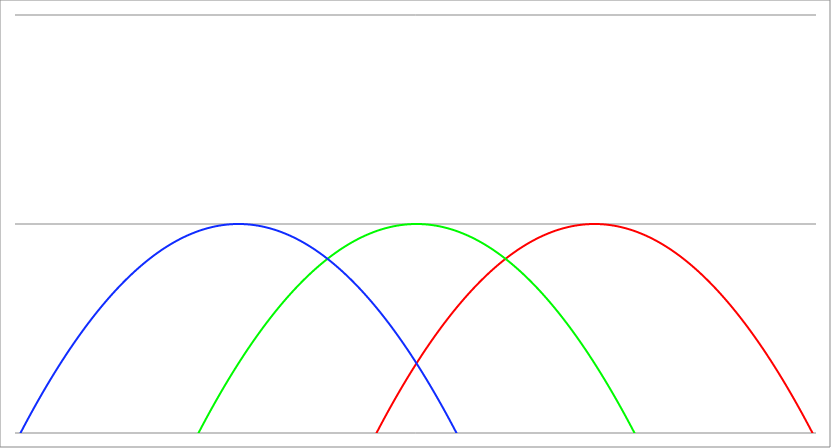
| Category | Series 1 | Series 0 | Series 2 |
|---|---|---|---|
| -4.5 | -42.25 | -20.25 | -6.25 |
| -4.4955 | -42.192 | -20.21 | -6.228 |
| -4.491 | -42.133 | -20.169 | -6.205 |
| -4.4865 | -42.075 | -20.129 | -6.183 |
| -4.482 | -42.016 | -20.088 | -6.16 |
| -4.4775 | -41.958 | -20.048 | -6.138 |
| -4.472999999999999 | -41.9 | -20.008 | -6.116 |
| -4.468499999999999 | -41.841 | -19.967 | -6.093 |
| -4.463999999999999 | -41.783 | -19.927 | -6.071 |
| -4.459499999999998 | -41.725 | -19.887 | -6.049 |
| -4.454999999999998 | -41.667 | -19.847 | -6.027 |
| -4.450499999999998 | -41.609 | -19.807 | -6.005 |
| -4.445999999999998 | -41.551 | -19.767 | -5.983 |
| -4.441499999999997 | -41.493 | -19.727 | -5.961 |
| -4.436999999999997 | -41.435 | -19.687 | -5.939 |
| -4.432499999999997 | -41.377 | -19.647 | -5.917 |
| -4.427999999999997 | -41.319 | -19.607 | -5.895 |
| -4.423499999999997 | -41.261 | -19.567 | -5.873 |
| -4.418999999999997 | -41.204 | -19.528 | -5.852 |
| -4.414499999999997 | -41.146 | -19.488 | -5.83 |
| -4.409999999999996 | -41.088 | -19.448 | -5.808 |
| -4.405499999999996 | -41.03 | -19.408 | -5.786 |
| -4.400999999999996 | -40.973 | -19.369 | -5.765 |
| -4.396499999999996 | -40.915 | -19.329 | -5.743 |
| -4.391999999999996 | -40.858 | -19.29 | -5.722 |
| -4.387499999999996 | -40.8 | -19.25 | -5.7 |
| -4.382999999999996 | -40.743 | -19.211 | -5.679 |
| -4.378499999999995 | -40.685 | -19.171 | -5.657 |
| -4.373999999999995 | -40.628 | -19.132 | -5.636 |
| -4.369499999999995 | -40.571 | -19.093 | -5.615 |
| -4.364999999999995 | -40.513 | -19.053 | -5.593 |
| -4.360499999999995 | -40.456 | -19.014 | -5.572 |
| -4.355999999999994 | -40.399 | -18.975 | -5.551 |
| -4.351499999999994 | -40.342 | -18.936 | -5.53 |
| -4.346999999999994 | -40.284 | -18.896 | -5.508 |
| -4.342499999999994 | -40.227 | -18.857 | -5.487 |
| -4.337999999999994 | -40.17 | -18.818 | -5.466 |
| -4.333499999999994 | -40.113 | -18.779 | -5.445 |
| -4.328999999999993 | -40.056 | -18.74 | -5.424 |
| -4.324499999999993 | -39.999 | -18.701 | -5.403 |
| -4.319999999999993 | -39.942 | -18.662 | -5.382 |
| -4.315499999999993 | -39.886 | -18.624 | -5.362 |
| -4.310999999999993 | -39.829 | -18.585 | -5.341 |
| -4.306499999999993 | -39.772 | -18.546 | -5.32 |
| -4.301999999999992 | -39.715 | -18.507 | -5.299 |
| -4.297499999999992 | -39.659 | -18.469 | -5.279 |
| -4.292999999999992 | -39.602 | -18.43 | -5.258 |
| -4.288499999999992 | -39.545 | -18.391 | -5.237 |
| -4.283999999999992 | -39.489 | -18.353 | -5.217 |
| -4.279499999999991 | -39.432 | -18.314 | -5.196 |
| -4.274999999999991 | -39.376 | -18.276 | -5.176 |
| -4.270499999999991 | -39.319 | -18.237 | -5.155 |
| -4.265999999999991 | -39.263 | -18.199 | -5.135 |
| -4.261499999999991 | -39.206 | -18.16 | -5.114 |
| -4.256999999999991 | -39.15 | -18.122 | -5.094 |
| -4.252499999999991 | -39.094 | -18.084 | -5.074 |
| -4.24799999999999 | -39.038 | -18.046 | -5.054 |
| -4.24349999999999 | -38.981 | -18.007 | -5.033 |
| -4.23899999999999 | -38.925 | -17.969 | -5.013 |
| -4.23449999999999 | -38.869 | -17.931 | -4.993 |
| -4.22999999999999 | -38.813 | -17.893 | -4.973 |
| -4.22549999999999 | -38.757 | -17.855 | -4.953 |
| -4.220999999999989 | -38.701 | -17.817 | -4.933 |
| -4.21649999999999 | -38.645 | -17.779 | -4.913 |
| -4.21199999999999 | -38.589 | -17.741 | -4.893 |
| -4.207499999999989 | -38.533 | -17.703 | -4.873 |
| -4.202999999999989 | -38.477 | -17.665 | -4.853 |
| -4.198499999999989 | -38.421 | -17.627 | -4.833 |
| -4.193999999999988 | -38.366 | -17.59 | -4.814 |
| -4.189499999999988 | -38.31 | -17.552 | -4.794 |
| -4.184999999999988 | -38.254 | -17.514 | -4.774 |
| -4.180499999999988 | -38.199 | -17.477 | -4.755 |
| -4.175999999999988 | -38.143 | -17.439 | -4.735 |
| -4.171499999999987 | -38.087 | -17.401 | -4.715 |
| -4.166999999999987 | -38.032 | -17.364 | -4.696 |
| -4.162499999999987 | -37.976 | -17.326 | -4.676 |
| -4.157999999999987 | -37.921 | -17.289 | -4.657 |
| -4.153499999999987 | -37.866 | -17.252 | -4.638 |
| -4.148999999999987 | -37.81 | -17.214 | -4.618 |
| -4.144499999999987 | -37.755 | -17.177 | -4.599 |
| -4.139999999999986 | -37.7 | -17.14 | -4.58 |
| -4.135499999999986 | -37.644 | -17.102 | -4.56 |
| -4.130999999999986 | -37.589 | -17.065 | -4.541 |
| -4.126499999999986 | -37.534 | -17.028 | -4.522 |
| -4.121999999999986 | -37.479 | -16.991 | -4.503 |
| -4.117499999999985 | -37.424 | -16.954 | -4.484 |
| -4.112999999999985 | -37.369 | -16.917 | -4.465 |
| -4.108499999999985 | -37.314 | -16.88 | -4.446 |
| -4.103999999999985 | -37.259 | -16.843 | -4.427 |
| -4.099499999999984 | -37.204 | -16.806 | -4.408 |
| -4.094999999999985 | -37.149 | -16.769 | -4.389 |
| -4.090499999999984 | -37.094 | -16.732 | -4.37 |
| -4.085999999999984 | -37.039 | -16.695 | -4.351 |
| -4.081499999999984 | -36.985 | -16.659 | -4.333 |
| -4.076999999999984 | -36.93 | -16.622 | -4.314 |
| -4.072499999999984 | -36.875 | -16.585 | -4.295 |
| -4.067999999999984 | -36.821 | -16.549 | -4.277 |
| -4.063499999999983 | -36.766 | -16.512 | -4.258 |
| -4.058999999999983 | -36.711 | -16.475 | -4.239 |
| -4.054499999999983 | -36.657 | -16.439 | -4.221 |
| -4.049999999999983 | -36.602 | -16.402 | -4.202 |
| -4.045499999999983 | -36.548 | -16.366 | -4.184 |
| -4.040999999999983 | -36.494 | -16.33 | -4.166 |
| -4.036499999999982 | -36.439 | -16.293 | -4.147 |
| -4.031999999999982 | -36.385 | -16.257 | -4.129 |
| -4.027499999999982 | -36.331 | -16.221 | -4.111 |
| -4.022999999999982 | -36.277 | -16.185 | -4.093 |
| -4.018499999999982 | -36.222 | -16.148 | -4.074 |
| -4.013999999999982 | -36.168 | -16.112 | -4.056 |
| -4.009499999999981 | -36.114 | -16.076 | -4.038 |
| -4.004999999999981 | -36.06 | -16.04 | -4.02 |
| -4.000499999999981 | -36.006 | -16.004 | -4.002 |
| -3.995999999999981 | -35.952 | -15.968 | -3.984 |
| -3.991499999999981 | -35.898 | -15.932 | -3.966 |
| -3.986999999999981 | -35.844 | -15.896 | -3.948 |
| -3.98249999999998 | -35.79 | -15.86 | -3.93 |
| -3.97799999999998 | -35.736 | -15.824 | -3.912 |
| -3.97349999999998 | -35.683 | -15.789 | -3.895 |
| -3.96899999999998 | -35.629 | -15.753 | -3.877 |
| -3.96449999999998 | -35.575 | -15.717 | -3.859 |
| -3.95999999999998 | -35.522 | -15.682 | -3.842 |
| -3.955499999999979 | -35.468 | -15.646 | -3.824 |
| -3.950999999999979 | -35.414 | -15.61 | -3.806 |
| -3.946499999999979 | -35.361 | -15.575 | -3.789 |
| -3.941999999999979 | -35.307 | -15.539 | -3.771 |
| -3.937499999999979 | -35.254 | -15.504 | -3.754 |
| -3.932999999999978 | -35.2 | -15.468 | -3.736 |
| -3.928499999999978 | -35.147 | -15.433 | -3.719 |
| -3.923999999999978 | -35.094 | -15.398 | -3.702 |
| -3.919499999999978 | -35.04 | -15.362 | -3.684 |
| -3.914999999999978 | -34.987 | -15.327 | -3.667 |
| -3.910499999999978 | -34.934 | -15.292 | -3.65 |
| -3.905999999999977 | -34.881 | -15.257 | -3.633 |
| -3.901499999999977 | -34.828 | -15.222 | -3.616 |
| -3.896999999999977 | -34.775 | -15.187 | -3.599 |
| -3.892499999999977 | -34.722 | -15.152 | -3.582 |
| -3.887999999999977 | -34.669 | -15.117 | -3.565 |
| -3.883499999999977 | -34.616 | -15.082 | -3.548 |
| -3.878999999999976 | -34.563 | -15.047 | -3.531 |
| -3.874499999999976 | -34.51 | -15.012 | -3.514 |
| -3.869999999999976 | -34.457 | -14.977 | -3.497 |
| -3.865499999999976 | -34.404 | -14.942 | -3.48 |
| -3.860999999999976 | -34.351 | -14.907 | -3.463 |
| -3.856499999999976 | -34.299 | -14.873 | -3.447 |
| -3.851999999999975 | -34.246 | -14.838 | -3.43 |
| -3.847499999999975 | -34.193 | -14.803 | -3.413 |
| -3.842999999999975 | -34.141 | -14.769 | -3.397 |
| -3.838499999999975 | -34.088 | -14.734 | -3.38 |
| -3.833999999999975 | -34.036 | -14.7 | -3.364 |
| -3.829499999999975 | -33.983 | -14.665 | -3.347 |
| -3.824999999999974 | -33.931 | -14.631 | -3.331 |
| -3.820499999999974 | -33.878 | -14.596 | -3.314 |
| -3.815999999999974 | -33.826 | -14.562 | -3.298 |
| -3.811499999999974 | -33.774 | -14.528 | -3.282 |
| -3.806999999999974 | -33.721 | -14.493 | -3.265 |
| -3.802499999999974 | -33.669 | -14.459 | -3.249 |
| -3.797999999999973 | -33.617 | -14.425 | -3.233 |
| -3.793499999999973 | -33.565 | -14.391 | -3.217 |
| -3.788999999999973 | -33.513 | -14.357 | -3.201 |
| -3.784499999999973 | -33.46 | -14.322 | -3.184 |
| -3.779999999999973 | -33.408 | -14.288 | -3.168 |
| -3.775499999999972 | -33.356 | -14.254 | -3.152 |
| -3.770999999999972 | -33.304 | -14.22 | -3.136 |
| -3.766499999999972 | -33.253 | -14.187 | -3.121 |
| -3.761999999999972 | -33.201 | -14.153 | -3.105 |
| -3.757499999999972 | -33.149 | -14.119 | -3.089 |
| -3.752999999999972 | -33.097 | -14.085 | -3.073 |
| -3.748499999999971 | -33.045 | -14.051 | -3.057 |
| -3.743999999999971 | -32.994 | -14.018 | -3.042 |
| -3.739499999999971 | -32.942 | -13.984 | -3.026 |
| -3.734999999999971 | -32.89 | -13.95 | -3.01 |
| -3.730499999999971 | -32.839 | -13.917 | -2.995 |
| -3.725999999999971 | -32.787 | -13.883 | -2.979 |
| -3.72149999999997 | -32.736 | -13.85 | -2.964 |
| -3.71699999999997 | -32.684 | -13.816 | -2.948 |
| -3.71249999999997 | -32.633 | -13.783 | -2.933 |
| -3.70799999999997 | -32.581 | -13.749 | -2.917 |
| -3.70349999999997 | -32.53 | -13.716 | -2.902 |
| -3.69899999999997 | -32.479 | -13.683 | -2.887 |
| -3.694499999999969 | -32.427 | -13.649 | -2.871 |
| -3.689999999999969 | -32.376 | -13.616 | -2.856 |
| -3.685499999999969 | -32.325 | -13.583 | -2.841 |
| -3.680999999999969 | -32.274 | -13.55 | -2.826 |
| -3.676499999999969 | -32.223 | -13.517 | -2.811 |
| -3.671999999999969 | -32.172 | -13.484 | -2.796 |
| -3.667499999999968 | -32.121 | -13.451 | -2.781 |
| -3.662999999999968 | -32.07 | -13.418 | -2.766 |
| -3.658499999999968 | -32.019 | -13.385 | -2.751 |
| -3.653999999999968 | -31.968 | -13.352 | -2.736 |
| -3.649499999999968 | -31.917 | -13.319 | -2.721 |
| -3.644999999999968 | -31.866 | -13.286 | -2.706 |
| -3.640499999999967 | -31.815 | -13.253 | -2.691 |
| -3.635999999999967 | -31.764 | -13.22 | -2.676 |
| -3.631499999999967 | -31.714 | -13.188 | -2.662 |
| -3.626999999999967 | -31.663 | -13.155 | -2.647 |
| -3.622499999999967 | -31.613 | -13.123 | -2.633 |
| -3.617999999999966 | -31.562 | -13.09 | -2.618 |
| -3.613499999999966 | -31.511 | -13.057 | -2.603 |
| -3.608999999999966 | -31.461 | -13.025 | -2.589 |
| -3.604499999999966 | -31.41 | -12.992 | -2.574 |
| -3.599999999999966 | -31.36 | -12.96 | -2.56 |
| -3.595499999999966 | -31.31 | -12.928 | -2.546 |
| -3.590999999999966 | -31.259 | -12.895 | -2.531 |
| -3.586499999999965 | -31.209 | -12.863 | -2.517 |
| -3.581999999999965 | -31.159 | -12.831 | -2.503 |
| -3.577499999999965 | -31.109 | -12.799 | -2.489 |
| -3.572999999999965 | -31.058 | -12.766 | -2.474 |
| -3.568499999999965 | -31.008 | -12.734 | -2.46 |
| -3.563999999999965 | -30.958 | -12.702 | -2.446 |
| -3.559499999999964 | -30.908 | -12.67 | -2.432 |
| -3.554999999999964 | -30.858 | -12.638 | -2.418 |
| -3.550499999999964 | -30.808 | -12.606 | -2.404 |
| -3.545999999999964 | -30.758 | -12.574 | -2.39 |
| -3.541499999999964 | -30.708 | -12.542 | -2.376 |
| -3.536999999999963 | -30.658 | -12.51 | -2.362 |
| -3.532499999999963 | -30.609 | -12.479 | -2.349 |
| -3.527999999999963 | -30.559 | -12.447 | -2.335 |
| -3.523499999999963 | -30.509 | -12.415 | -2.321 |
| -3.518999999999963 | -30.459 | -12.383 | -2.307 |
| -3.514499999999963 | -30.41 | -12.352 | -2.294 |
| -3.509999999999962 | -30.36 | -12.32 | -2.28 |
| -3.505499999999962 | -30.311 | -12.289 | -2.267 |
| -3.500999999999962 | -30.261 | -12.257 | -2.253 |
| -3.496499999999962 | -30.212 | -12.226 | -2.24 |
| -3.491999999999962 | -30.162 | -12.194 | -2.226 |
| -3.487499999999962 | -30.113 | -12.163 | -2.213 |
| -3.482999999999961 | -30.063 | -12.131 | -2.199 |
| -3.478499999999961 | -30.014 | -12.1 | -2.186 |
| -3.473999999999961 | -29.965 | -12.069 | -2.173 |
| -3.469499999999961 | -29.915 | -12.037 | -2.159 |
| -3.464999999999961 | -29.866 | -12.006 | -2.146 |
| -3.460499999999961 | -29.817 | -11.975 | -2.133 |
| -3.45599999999996 | -29.768 | -11.944 | -2.12 |
| -3.45149999999996 | -29.719 | -11.913 | -2.107 |
| -3.44699999999996 | -29.67 | -11.882 | -2.094 |
| -3.44249999999996 | -29.621 | -11.851 | -2.081 |
| -3.43799999999996 | -29.572 | -11.82 | -2.068 |
| -3.43349999999996 | -29.523 | -11.789 | -2.055 |
| -3.428999999999959 | -29.474 | -11.758 | -2.042 |
| -3.424499999999959 | -29.425 | -11.727 | -2.029 |
| -3.419999999999959 | -29.376 | -11.696 | -2.016 |
| -3.415499999999959 | -29.328 | -11.666 | -2.004 |
| -3.410999999999959 | -29.279 | -11.635 | -1.991 |
| -3.406499999999959 | -29.23 | -11.604 | -1.978 |
| -3.401999999999958 | -29.182 | -11.574 | -1.966 |
| -3.397499999999958 | -29.133 | -11.543 | -1.953 |
| -3.392999999999958 | -29.084 | -11.512 | -1.94 |
| -3.388499999999958 | -29.036 | -11.482 | -1.928 |
| -3.383999999999958 | -28.987 | -11.451 | -1.915 |
| -3.379499999999957 | -28.939 | -11.421 | -1.903 |
| -3.374999999999957 | -28.891 | -11.391 | -1.891 |
| -3.370499999999957 | -28.842 | -11.36 | -1.878 |
| -3.365999999999957 | -28.794 | -11.33 | -1.866 |
| -3.361499999999957 | -28.746 | -11.3 | -1.854 |
| -3.356999999999957 | -28.697 | -11.269 | -1.841 |
| -3.352499999999956 | -28.649 | -11.239 | -1.829 |
| -3.347999999999956 | -28.601 | -11.209 | -1.817 |
| -3.343499999999956 | -28.553 | -11.179 | -1.805 |
| -3.338999999999956 | -28.505 | -11.149 | -1.793 |
| -3.334499999999956 | -28.457 | -11.119 | -1.781 |
| -3.329999999999956 | -28.409 | -11.089 | -1.769 |
| -3.325499999999955 | -28.361 | -11.059 | -1.757 |
| -3.320999999999955 | -28.313 | -11.029 | -1.745 |
| -3.316499999999955 | -28.265 | -10.999 | -1.733 |
| -3.311999999999955 | -28.217 | -10.969 | -1.721 |
| -3.307499999999955 | -28.17 | -10.94 | -1.71 |
| -3.302999999999955 | -28.122 | -10.91 | -1.698 |
| -3.298499999999954 | -28.074 | -10.88 | -1.686 |
| -3.293999999999954 | -28.026 | -10.85 | -1.674 |
| -3.289499999999954 | -27.979 | -10.821 | -1.663 |
| -3.284999999999954 | -27.931 | -10.791 | -1.651 |
| -3.280499999999954 | -27.884 | -10.762 | -1.64 |
| -3.275999999999954 | -27.836 | -10.732 | -1.628 |
| -3.271499999999953 | -27.789 | -10.703 | -1.617 |
| -3.266999999999953 | -27.741 | -10.673 | -1.605 |
| -3.262499999999953 | -27.694 | -10.644 | -1.594 |
| -3.257999999999953 | -27.647 | -10.615 | -1.583 |
| -3.253499999999953 | -27.599 | -10.585 | -1.571 |
| -3.248999999999952 | -27.552 | -10.556 | -1.56 |
| -3.244499999999952 | -27.505 | -10.527 | -1.549 |
| -3.239999999999952 | -27.458 | -10.498 | -1.538 |
| -3.235499999999952 | -27.41 | -10.468 | -1.526 |
| -3.230999999999952 | -27.363 | -10.439 | -1.515 |
| -3.226499999999952 | -27.316 | -10.41 | -1.504 |
| -3.221999999999952 | -27.269 | -10.381 | -1.493 |
| -3.217499999999951 | -27.222 | -10.352 | -1.482 |
| -3.212999999999951 | -27.175 | -10.323 | -1.471 |
| -3.208499999999951 | -27.128 | -10.294 | -1.46 |
| -3.203999999999951 | -27.082 | -10.266 | -1.45 |
| -3.199499999999951 | -27.035 | -10.237 | -1.439 |
| -3.194999999999951 | -26.988 | -10.208 | -1.428 |
| -3.19049999999995 | -26.941 | -10.179 | -1.417 |
| -3.18599999999995 | -26.895 | -10.151 | -1.407 |
| -3.18149999999995 | -26.848 | -10.122 | -1.396 |
| -3.17699999999995 | -26.801 | -10.093 | -1.385 |
| -3.17249999999995 | -26.755 | -10.065 | -1.375 |
| -3.16799999999995 | -26.708 | -10.036 | -1.364 |
| -3.163499999999949 | -26.662 | -10.008 | -1.354 |
| -3.158999999999949 | -26.615 | -9.979 | -1.343 |
| -3.154499999999949 | -26.569 | -9.951 | -1.333 |
| -3.149999999999949 | -26.522 | -9.922 | -1.322 |
| -3.145499999999949 | -26.476 | -9.894 | -1.312 |
| -3.140999999999948 | -26.43 | -9.866 | -1.302 |
| -3.136499999999948 | -26.384 | -9.838 | -1.292 |
| -3.131999999999948 | -26.337 | -9.809 | -1.281 |
| -3.127499999999948 | -26.291 | -9.781 | -1.271 |
| -3.122999999999948 | -26.245 | -9.753 | -1.261 |
| -3.118499999999948 | -26.199 | -9.725 | -1.251 |
| -3.113999999999947 | -26.153 | -9.697 | -1.241 |
| -3.109499999999947 | -26.107 | -9.669 | -1.231 |
| -3.104999999999947 | -26.061 | -9.641 | -1.221 |
| -3.100499999999947 | -26.015 | -9.613 | -1.211 |
| -3.095999999999947 | -25.969 | -9.585 | -1.201 |
| -3.091499999999947 | -25.923 | -9.557 | -1.191 |
| -3.086999999999946 | -25.878 | -9.53 | -1.182 |
| -3.082499999999946 | -25.832 | -9.502 | -1.172 |
| -3.077999999999946 | -25.786 | -9.474 | -1.162 |
| -3.073499999999946 | -25.74 | -9.446 | -1.152 |
| -3.068999999999946 | -25.695 | -9.419 | -1.143 |
| -3.064499999999946 | -25.649 | -9.391 | -1.133 |
| -3.059999999999945 | -25.604 | -9.364 | -1.124 |
| -3.055499999999945 | -25.558 | -9.336 | -1.114 |
| -3.050999999999945 | -25.513 | -9.309 | -1.105 |
| -3.046499999999945 | -25.467 | -9.281 | -1.095 |
| -3.041999999999945 | -25.422 | -9.254 | -1.086 |
| -3.037499999999945 | -25.376 | -9.226 | -1.076 |
| -3.032999999999944 | -25.331 | -9.199 | -1.067 |
| -3.028499999999944 | -25.286 | -9.172 | -1.058 |
| -3.023999999999944 | -25.241 | -9.145 | -1.049 |
| -3.019499999999944 | -25.195 | -9.117 | -1.039 |
| -3.014999999999944 | -25.15 | -9.09 | -1.03 |
| -3.010499999999944 | -25.105 | -9.063 | -1.021 |
| -3.005999999999943 | -25.06 | -9.036 | -1.012 |
| -3.001499999999943 | -25.015 | -9.009 | -1.003 |
| -2.996999999999943 | -24.97 | -8.982 | -0.994 |
| -2.992499999999943 | -24.925 | -8.955 | -0.985 |
| -2.987999999999943 | -24.88 | -8.928 | -0.976 |
| -2.983499999999942 | -24.835 | -8.901 | -0.967 |
| -2.978999999999942 | -24.79 | -8.874 | -0.958 |
| -2.974499999999942 | -24.746 | -8.848 | -0.95 |
| -2.969999999999942 | -24.701 | -8.821 | -0.941 |
| -2.965499999999942 | -24.656 | -8.794 | -0.932 |
| -2.960999999999942 | -24.612 | -8.768 | -0.924 |
| -2.956499999999941 | -24.567 | -8.741 | -0.915 |
| -2.951999999999941 | -24.522 | -8.714 | -0.906 |
| -2.947499999999941 | -24.478 | -8.688 | -0.898 |
| -2.942999999999941 | -24.433 | -8.661 | -0.889 |
| -2.938499999999941 | -24.389 | -8.635 | -0.881 |
| -2.933999999999941 | -24.344 | -8.608 | -0.872 |
| -2.92949999999994 | -24.3 | -8.582 | -0.864 |
| -2.92499999999994 | -24.256 | -8.556 | -0.856 |
| -2.92049999999994 | -24.211 | -8.529 | -0.847 |
| -2.91599999999994 | -24.167 | -8.503 | -0.839 |
| -2.91149999999994 | -24.123 | -8.477 | -0.831 |
| -2.90699999999994 | -24.079 | -8.451 | -0.823 |
| -2.902499999999939 | -24.035 | -8.425 | -0.815 |
| -2.897999999999939 | -23.99 | -8.398 | -0.806 |
| -2.893499999999939 | -23.946 | -8.372 | -0.798 |
| -2.888999999999939 | -23.902 | -8.346 | -0.79 |
| -2.884499999999939 | -23.858 | -8.32 | -0.782 |
| -2.879999999999939 | -23.814 | -8.294 | -0.774 |
| -2.875499999999938 | -23.771 | -8.269 | -0.767 |
| -2.870999999999938 | -23.727 | -8.243 | -0.759 |
| -2.866499999999938 | -23.683 | -8.217 | -0.751 |
| -2.861999999999938 | -23.639 | -8.191 | -0.743 |
| -2.857499999999938 | -23.595 | -8.165 | -0.735 |
| -2.852999999999938 | -23.552 | -8.14 | -0.728 |
| -2.848499999999937 | -23.508 | -8.114 | -0.72 |
| -2.843999999999937 | -23.464 | -8.088 | -0.712 |
| -2.839499999999937 | -23.421 | -8.063 | -0.705 |
| -2.834999999999937 | -23.377 | -8.037 | -0.697 |
| -2.830499999999937 | -23.334 | -8.012 | -0.69 |
| -2.825999999999937 | -23.29 | -7.986 | -0.682 |
| -2.821499999999936 | -23.247 | -7.961 | -0.675 |
| -2.816999999999936 | -23.203 | -7.935 | -0.667 |
| -2.812499999999936 | -23.16 | -7.91 | -0.66 |
| -2.807999999999936 | -23.117 | -7.885 | -0.653 |
| -2.803499999999936 | -23.074 | -7.86 | -0.646 |
| -2.798999999999935 | -23.03 | -7.834 | -0.638 |
| -2.794499999999935 | -22.987 | -7.809 | -0.631 |
| -2.789999999999935 | -22.944 | -7.784 | -0.624 |
| -2.785499999999935 | -22.901 | -7.759 | -0.617 |
| -2.780999999999935 | -22.858 | -7.734 | -0.61 |
| -2.776499999999935 | -22.815 | -7.709 | -0.603 |
| -2.771999999999934 | -22.772 | -7.684 | -0.596 |
| -2.767499999999934 | -22.729 | -7.659 | -0.589 |
| -2.762999999999934 | -22.686 | -7.634 | -0.582 |
| -2.758499999999934 | -22.643 | -7.609 | -0.575 |
| -2.753999999999934 | -22.601 | -7.585 | -0.569 |
| -2.749499999999934 | -22.558 | -7.56 | -0.562 |
| -2.744999999999933 | -22.515 | -7.535 | -0.555 |
| -2.740499999999933 | -22.472 | -7.51 | -0.548 |
| -2.735999999999933 | -22.43 | -7.486 | -0.542 |
| -2.731499999999933 | -22.387 | -7.461 | -0.535 |
| -2.726999999999933 | -22.345 | -7.437 | -0.529 |
| -2.722499999999933 | -22.302 | -7.412 | -0.522 |
| -2.717999999999932 | -22.26 | -7.388 | -0.516 |
| -2.713499999999932 | -22.217 | -7.363 | -0.509 |
| -2.708999999999932 | -22.175 | -7.339 | -0.503 |
| -2.704499999999932 | -22.132 | -7.314 | -0.496 |
| -2.699999999999932 | -22.09 | -7.29 | -0.49 |
| -2.695499999999932 | -22.048 | -7.266 | -0.484 |
| -2.690999999999931 | -22.005 | -7.241 | -0.477 |
| -2.686499999999931 | -21.963 | -7.217 | -0.471 |
| -2.681999999999931 | -21.921 | -7.193 | -0.465 |
| -2.677499999999931 | -21.879 | -7.169 | -0.459 |
| -2.672999999999931 | -21.837 | -7.145 | -0.453 |
| -2.66849999999993 | -21.795 | -7.121 | -0.447 |
| -2.66399999999993 | -21.753 | -7.097 | -0.441 |
| -2.65949999999993 | -21.711 | -7.073 | -0.435 |
| -2.65499999999993 | -21.669 | -7.049 | -0.429 |
| -2.65049999999993 | -21.627 | -7.025 | -0.423 |
| -2.64599999999993 | -21.585 | -7.001 | -0.417 |
| -2.641499999999929 | -21.544 | -6.978 | -0.412 |
| -2.636999999999929 | -21.502 | -6.954 | -0.406 |
| -2.632499999999929 | -21.46 | -6.93 | -0.4 |
| -2.627999999999929 | -21.418 | -6.906 | -0.394 |
| -2.623499999999929 | -21.377 | -6.883 | -0.389 |
| -2.618999999999929 | -21.335 | -6.859 | -0.383 |
| -2.614499999999928 | -21.294 | -6.836 | -0.378 |
| -2.609999999999928 | -21.252 | -6.812 | -0.372 |
| -2.605499999999928 | -21.211 | -6.789 | -0.367 |
| -2.600999999999928 | -21.169 | -6.765 | -0.361 |
| -2.596499999999928 | -21.128 | -6.742 | -0.356 |
| -2.591999999999928 | -21.086 | -6.718 | -0.35 |
| -2.587499999999928 | -21.045 | -6.695 | -0.345 |
| -2.582999999999927 | -21.004 | -6.672 | -0.34 |
| -2.578499999999927 | -20.963 | -6.649 | -0.335 |
| -2.573999999999927 | -20.921 | -6.625 | -0.329 |
| -2.569499999999927 | -20.88 | -6.602 | -0.324 |
| -2.564999999999927 | -20.839 | -6.579 | -0.319 |
| -2.560499999999926 | -20.798 | -6.556 | -0.314 |
| -2.555999999999926 | -20.757 | -6.533 | -0.309 |
| -2.551499999999926 | -20.716 | -6.51 | -0.304 |
| -2.546999999999926 | -20.675 | -6.487 | -0.299 |
| -2.542499999999926 | -20.634 | -6.464 | -0.294 |
| -2.537999999999926 | -20.593 | -6.441 | -0.289 |
| -2.533499999999925 | -20.553 | -6.419 | -0.285 |
| -2.528999999999925 | -20.512 | -6.396 | -0.28 |
| -2.524499999999925 | -20.471 | -6.373 | -0.275 |
| -2.519999999999925 | -20.43 | -6.35 | -0.27 |
| -2.515499999999925 | -20.39 | -6.328 | -0.266 |
| -2.510999999999925 | -20.349 | -6.305 | -0.261 |
| -2.506499999999924 | -20.309 | -6.283 | -0.257 |
| -2.501999999999924 | -20.268 | -6.26 | -0.252 |
| -2.497499999999924 | -20.228 | -6.238 | -0.248 |
| -2.492999999999924 | -20.187 | -6.215 | -0.243 |
| -2.488499999999924 | -20.147 | -6.193 | -0.239 |
| -2.483999999999924 | -20.106 | -6.17 | -0.234 |
| -2.479499999999923 | -20.066 | -6.148 | -0.23 |
| -2.474999999999923 | -20.026 | -6.126 | -0.226 |
| -2.470499999999923 | -19.985 | -6.103 | -0.221 |
| -2.465999999999923 | -19.945 | -6.081 | -0.217 |
| -2.461499999999923 | -19.905 | -6.059 | -0.213 |
| -2.456999999999923 | -19.865 | -6.037 | -0.209 |
| -2.452499999999922 | -19.825 | -6.015 | -0.205 |
| -2.447999999999922 | -19.785 | -5.993 | -0.201 |
| -2.443499999999922 | -19.745 | -5.971 | -0.197 |
| -2.438999999999922 | -19.705 | -5.949 | -0.193 |
| -2.434499999999922 | -19.665 | -5.927 | -0.189 |
| -2.429999999999922 | -19.625 | -5.905 | -0.185 |
| -2.425499999999921 | -19.585 | -5.883 | -0.181 |
| -2.420999999999921 | -19.545 | -5.861 | -0.177 |
| -2.416499999999921 | -19.505 | -5.839 | -0.173 |
| -2.411999999999921 | -19.466 | -5.818 | -0.17 |
| -2.407499999999921 | -19.426 | -5.796 | -0.166 |
| -2.402999999999921 | -19.386 | -5.774 | -0.162 |
| -2.39849999999992 | -19.347 | -5.753 | -0.159 |
| -2.39399999999992 | -19.307 | -5.731 | -0.155 |
| -2.38949999999992 | -19.268 | -5.71 | -0.152 |
| -2.38499999999992 | -19.228 | -5.688 | -0.148 |
| -2.38049999999992 | -19.189 | -5.667 | -0.145 |
| -2.375999999999919 | -19.149 | -5.645 | -0.141 |
| -2.371499999999919 | -19.11 | -5.624 | -0.138 |
| -2.366999999999919 | -19.071 | -5.603 | -0.135 |
| -2.362499999999919 | -19.031 | -5.581 | -0.131 |
| -2.357999999999919 | -18.992 | -5.56 | -0.128 |
| -2.353499999999919 | -18.953 | -5.539 | -0.125 |
| -2.348999999999918 | -18.914 | -5.518 | -0.122 |
| -2.344499999999918 | -18.875 | -5.497 | -0.119 |
| -2.339999999999918 | -18.836 | -5.476 | -0.116 |
| -2.335499999999918 | -18.797 | -5.455 | -0.113 |
| -2.330999999999918 | -18.758 | -5.434 | -0.11 |
| -2.326499999999918 | -18.719 | -5.413 | -0.107 |
| -2.321999999999917 | -18.68 | -5.392 | -0.104 |
| -2.317499999999917 | -18.641 | -5.371 | -0.101 |
| -2.312999999999917 | -18.602 | -5.35 | -0.098 |
| -2.308499999999917 | -18.563 | -5.329 | -0.095 |
| -2.303999999999917 | -18.524 | -5.308 | -0.092 |
| -2.299499999999917 | -18.486 | -5.288 | -0.09 |
| -2.294999999999916 | -18.447 | -5.267 | -0.087 |
| -2.290499999999916 | -18.408 | -5.246 | -0.084 |
| -2.285999999999916 | -18.37 | -5.226 | -0.082 |
| -2.281499999999916 | -18.331 | -5.205 | -0.079 |
| -2.276999999999916 | -18.293 | -5.185 | -0.077 |
| -2.272499999999916 | -18.254 | -5.164 | -0.074 |
| -2.267999999999915 | -18.216 | -5.144 | -0.072 |
| -2.263499999999915 | -18.177 | -5.123 | -0.069 |
| -2.258999999999915 | -18.139 | -5.103 | -0.067 |
| -2.254499999999915 | -18.101 | -5.083 | -0.065 |
| -2.249999999999915 | -18.062 | -5.062 | -0.062 |
| -2.245499999999915 | -18.024 | -5.042 | -0.06 |
| -2.240999999999914 | -17.986 | -5.022 | -0.058 |
| -2.236499999999914 | -17.948 | -5.002 | -0.056 |
| -2.231999999999914 | -17.91 | -4.982 | -0.054 |
| -2.227499999999914 | -17.872 | -4.962 | -0.052 |
| -2.222999999999914 | -17.834 | -4.942 | -0.05 |
| -2.218499999999914 | -17.796 | -4.922 | -0.048 |
| -2.213999999999913 | -17.758 | -4.902 | -0.046 |
| -2.209499999999913 | -17.72 | -4.882 | -0.044 |
| -2.204999999999913 | -17.682 | -4.862 | -0.042 |
| -2.200499999999913 | -17.644 | -4.842 | -0.04 |
| -2.195999999999913 | -17.606 | -4.822 | -0.038 |
| -2.191499999999912 | -17.569 | -4.803 | -0.037 |
| -2.186999999999912 | -17.531 | -4.783 | -0.035 |
| -2.182499999999912 | -17.493 | -4.763 | -0.033 |
| -2.177999999999912 | -17.456 | -4.744 | -0.032 |
| -2.173499999999912 | -17.418 | -4.724 | -0.03 |
| -2.168999999999912 | -17.381 | -4.705 | -0.029 |
| -2.164499999999911 | -17.343 | -4.685 | -0.027 |
| -2.159999999999911 | -17.306 | -4.666 | -0.026 |
| -2.155499999999911 | -17.268 | -4.646 | -0.024 |
| -2.150999999999911 | -17.231 | -4.627 | -0.023 |
| -2.146499999999911 | -17.193 | -4.607 | -0.021 |
| -2.141999999999911 | -17.156 | -4.588 | -0.02 |
| -2.13749999999991 | -17.119 | -4.569 | -0.019 |
| -2.13299999999991 | -17.082 | -4.55 | -0.018 |
| -2.12849999999991 | -17.045 | -4.531 | -0.017 |
| -2.12399999999991 | -17.007 | -4.511 | -0.015 |
| -2.11949999999991 | -16.97 | -4.492 | -0.014 |
| -2.11499999999991 | -16.933 | -4.473 | -0.013 |
| -2.110499999999909 | -16.896 | -4.454 | -0.012 |
| -2.105999999999909 | -16.859 | -4.435 | -0.011 |
| -2.101499999999909 | -16.822 | -4.416 | -0.01 |
| -2.096999999999909 | -16.785 | -4.397 | -0.009 |
| -2.092499999999909 | -16.749 | -4.379 | -0.009 |
| -2.087999999999909 | -16.712 | -4.36 | -0.008 |
| -2.083499999999908 | -16.675 | -4.341 | -0.007 |
| -2.078999999999908 | -16.638 | -4.322 | -0.006 |
| -2.074499999999908 | -16.602 | -4.304 | -0.006 |
| -2.069999999999908 | -16.565 | -4.285 | -0.005 |
| -2.065499999999908 | -16.528 | -4.266 | -0.004 |
| -2.060999999999908 | -16.492 | -4.248 | -0.004 |
| -2.056499999999907 | -16.455 | -4.229 | -0.003 |
| -2.051999999999907 | -16.419 | -4.211 | -0.003 |
| -2.047499999999907 | -16.382 | -4.192 | -0.002 |
| -2.042999999999907 | -16.346 | -4.174 | -0.002 |
| -2.038499999999907 | -16.309 | -4.155 | -0.001 |
| -2.033999999999907 | -16.273 | -4.137 | -0.001 |
| -2.029499999999906 | -16.237 | -4.119 | -0.001 |
| -2.024999999999906 | -16.201 | -4.101 | -0.001 |
| -2.020499999999906 | -16.164 | -4.082 | 0 |
| -2.015999999999906 | -16.128 | -4.064 | 0 |
| -2.011499999999906 | -16.092 | -4.046 | 0 |
| -2.006999999999906 | -16.056 | -4.028 | 0 |
| -2.002499999999905 | -16.02 | -4.01 | 0 |
| -1.997999999999905 | -15.984 | -3.992 | 0 |
| -1.993499999999905 | -15.948 | -3.974 | 0 |
| -1.988999999999905 | -15.912 | -3.956 | 0 |
| -1.984499999999906 | -15.876 | -3.938 | 0 |
| -1.979999999999906 | -15.84 | -3.92 | 0 |
| -1.975499999999906 | -15.805 | -3.903 | -0.001 |
| -1.970999999999906 | -15.769 | -3.885 | -0.001 |
| -1.966499999999906 | -15.733 | -3.867 | -0.001 |
| -1.961999999999906 | -15.697 | -3.849 | -0.001 |
| -1.957499999999906 | -15.662 | -3.832 | -0.002 |
| -1.952999999999906 | -15.626 | -3.814 | -0.002 |
| -1.948499999999906 | -15.591 | -3.797 | -0.003 |
| -1.943999999999906 | -15.555 | -3.779 | -0.003 |
| -1.939499999999906 | -15.52 | -3.762 | -0.004 |
| -1.934999999999906 | -15.484 | -3.744 | -0.004 |
| -1.930499999999906 | -15.449 | -3.727 | -0.005 |
| -1.925999999999906 | -15.413 | -3.709 | -0.005 |
| -1.921499999999906 | -15.378 | -3.692 | -0.006 |
| -1.916999999999906 | -15.343 | -3.675 | -0.007 |
| -1.912499999999906 | -15.308 | -3.658 | -0.008 |
| -1.907999999999906 | -15.272 | -3.64 | -0.008 |
| -1.903499999999906 | -15.237 | -3.623 | -0.009 |
| -1.898999999999906 | -15.202 | -3.606 | -0.01 |
| -1.894499999999907 | -15.167 | -3.589 | -0.011 |
| -1.889999999999907 | -15.132 | -3.572 | -0.012 |
| -1.885499999999907 | -15.097 | -3.555 | -0.013 |
| -1.880999999999907 | -15.062 | -3.538 | -0.014 |
| -1.876499999999907 | -15.027 | -3.521 | -0.015 |
| -1.871999999999907 | -14.992 | -3.504 | -0.016 |
| -1.867499999999907 | -14.958 | -3.488 | -0.018 |
| -1.862999999999907 | -14.923 | -3.471 | -0.019 |
| -1.858499999999907 | -14.888 | -3.454 | -0.02 |
| -1.853999999999907 | -14.853 | -3.437 | -0.021 |
| -1.849499999999907 | -14.819 | -3.421 | -0.023 |
| -1.844999999999907 | -14.784 | -3.404 | -0.024 |
| -1.840499999999907 | -14.749 | -3.387 | -0.025 |
| -1.835999999999907 | -14.715 | -3.371 | -0.027 |
| -1.831499999999907 | -14.68 | -3.354 | -0.028 |
| -1.826999999999907 | -14.646 | -3.338 | -0.03 |
| -1.822499999999907 | -14.612 | -3.322 | -0.032 |
| -1.817999999999907 | -14.577 | -3.305 | -0.033 |
| -1.813499999999907 | -14.543 | -3.289 | -0.035 |
| -1.808999999999908 | -14.508 | -3.272 | -0.036 |
| -1.804499999999908 | -14.474 | -3.256 | -0.038 |
| -1.799999999999908 | -14.44 | -3.24 | -0.04 |
| -1.795499999999908 | -14.406 | -3.224 | -0.042 |
| -1.790999999999908 | -14.372 | -3.208 | -0.044 |
| -1.786499999999908 | -14.338 | -3.192 | -0.046 |
| -1.781999999999908 | -14.304 | -3.176 | -0.048 |
| -1.777499999999908 | -14.27 | -3.16 | -0.05 |
| -1.772999999999908 | -14.236 | -3.144 | -0.052 |
| -1.768499999999908 | -14.202 | -3.128 | -0.054 |
| -1.763999999999908 | -14.168 | -3.112 | -0.056 |
| -1.759499999999908 | -14.134 | -3.096 | -0.058 |
| -1.754999999999908 | -14.1 | -3.08 | -0.06 |
| -1.750499999999908 | -14.066 | -3.064 | -0.062 |
| -1.745999999999908 | -14.033 | -3.049 | -0.065 |
| -1.741499999999908 | -13.999 | -3.033 | -0.067 |
| -1.736999999999908 | -13.965 | -3.017 | -0.069 |
| -1.732499999999908 | -13.932 | -3.002 | -0.072 |
| -1.727999999999908 | -13.898 | -2.986 | -0.074 |
| -1.723499999999908 | -13.864 | -2.97 | -0.076 |
| -1.718999999999909 | -13.831 | -2.955 | -0.079 |
| -1.714499999999909 | -13.798 | -2.94 | -0.082 |
| -1.709999999999909 | -13.764 | -2.924 | -0.084 |
| -1.705499999999909 | -13.731 | -2.909 | -0.087 |
| -1.700999999999909 | -13.697 | -2.893 | -0.089 |
| -1.696499999999909 | -13.664 | -2.878 | -0.092 |
| -1.691999999999909 | -13.631 | -2.863 | -0.095 |
| -1.687499999999909 | -13.598 | -2.848 | -0.098 |
| -1.682999999999909 | -13.564 | -2.832 | -0.1 |
| -1.678499999999909 | -13.531 | -2.817 | -0.103 |
| -1.673999999999909 | -13.498 | -2.802 | -0.106 |
| -1.669499999999909 | -13.465 | -2.787 | -0.109 |
| -1.664999999999909 | -13.432 | -2.772 | -0.112 |
| -1.660499999999909 | -13.399 | -2.757 | -0.115 |
| -1.655999999999909 | -13.366 | -2.742 | -0.118 |
| -1.651499999999909 | -13.333 | -2.727 | -0.121 |
| -1.646999999999909 | -13.301 | -2.713 | -0.125 |
| -1.642499999999909 | -13.268 | -2.698 | -0.128 |
| -1.637999999999909 | -13.235 | -2.683 | -0.131 |
| -1.633499999999909 | -13.202 | -2.668 | -0.134 |
| -1.62899999999991 | -13.17 | -2.654 | -0.138 |
| -1.62449999999991 | -13.137 | -2.639 | -0.141 |
| -1.61999999999991 | -13.104 | -2.624 | -0.144 |
| -1.61549999999991 | -13.072 | -2.61 | -0.148 |
| -1.61099999999991 | -13.039 | -2.595 | -0.151 |
| -1.60649999999991 | -13.007 | -2.581 | -0.155 |
| -1.60199999999991 | -12.974 | -2.566 | -0.158 |
| -1.59749999999991 | -12.942 | -2.552 | -0.162 |
| -1.59299999999991 | -12.91 | -2.538 | -0.166 |
| -1.58849999999991 | -12.877 | -2.523 | -0.169 |
| -1.58399999999991 | -12.845 | -2.509 | -0.173 |
| -1.57949999999991 | -12.813 | -2.495 | -0.177 |
| -1.57499999999991 | -12.781 | -2.481 | -0.181 |
| -1.57049999999991 | -12.748 | -2.466 | -0.184 |
| -1.56599999999991 | -12.716 | -2.452 | -0.188 |
| -1.56149999999991 | -12.684 | -2.438 | -0.192 |
| -1.55699999999991 | -12.652 | -2.424 | -0.196 |
| -1.55249999999991 | -12.62 | -2.41 | -0.2 |
| -1.547999999999911 | -12.588 | -2.396 | -0.204 |
| -1.543499999999911 | -12.556 | -2.382 | -0.208 |
| -1.538999999999911 | -12.525 | -2.369 | -0.213 |
| -1.534499999999911 | -12.493 | -2.355 | -0.217 |
| -1.529999999999911 | -12.461 | -2.341 | -0.221 |
| -1.525499999999911 | -12.429 | -2.327 | -0.225 |
| -1.520999999999911 | -12.397 | -2.313 | -0.229 |
| -1.516499999999911 | -12.366 | -2.3 | -0.234 |
| -1.511999999999911 | -12.334 | -2.286 | -0.238 |
| -1.507499999999911 | -12.303 | -2.273 | -0.243 |
| -1.502999999999911 | -12.271 | -2.259 | -0.247 |
| -1.498499999999911 | -12.24 | -2.246 | -0.252 |
| -1.493999999999911 | -12.208 | -2.232 | -0.256 |
| -1.489499999999911 | -12.177 | -2.219 | -0.261 |
| -1.484999999999911 | -12.145 | -2.205 | -0.265 |
| -1.480499999999911 | -12.114 | -2.192 | -0.27 |
| -1.475999999999911 | -12.083 | -2.179 | -0.275 |
| -1.471499999999911 | -12.051 | -2.165 | -0.279 |
| -1.466999999999911 | -12.02 | -2.152 | -0.284 |
| -1.462499999999912 | -11.989 | -2.139 | -0.289 |
| -1.457999999999912 | -11.958 | -2.126 | -0.294 |
| -1.453499999999912 | -11.927 | -2.113 | -0.299 |
| -1.448999999999912 | -11.896 | -2.1 | -0.304 |
| -1.444499999999912 | -11.865 | -2.087 | -0.309 |
| -1.439999999999912 | -11.834 | -2.074 | -0.314 |
| -1.435499999999912 | -11.803 | -2.061 | -0.319 |
| -1.430999999999912 | -11.772 | -2.048 | -0.324 |
| -1.426499999999912 | -11.741 | -2.035 | -0.329 |
| -1.421999999999912 | -11.71 | -2.022 | -0.334 |
| -1.417499999999912 | -11.679 | -2.009 | -0.339 |
| -1.412999999999912 | -11.649 | -1.997 | -0.345 |
| -1.408499999999912 | -11.618 | -1.984 | -0.35 |
| -1.403999999999912 | -11.587 | -1.971 | -0.355 |
| -1.399499999999912 | -11.557 | -1.959 | -0.361 |
| -1.394999999999912 | -11.526 | -1.946 | -0.366 |
| -1.390499999999912 | -11.495 | -1.933 | -0.371 |
| -1.385999999999912 | -11.465 | -1.921 | -0.377 |
| -1.381499999999912 | -11.435 | -1.909 | -0.383 |
| -1.376999999999912 | -11.404 | -1.896 | -0.388 |
| -1.372499999999913 | -11.374 | -1.884 | -0.394 |
| -1.367999999999913 | -11.343 | -1.871 | -0.399 |
| -1.363499999999913 | -11.313 | -1.859 | -0.405 |
| -1.358999999999913 | -11.283 | -1.847 | -0.411 |
| -1.354499999999913 | -11.253 | -1.835 | -0.417 |
| -1.349999999999913 | -11.222 | -1.822 | -0.423 |
| -1.345499999999913 | -11.192 | -1.81 | -0.428 |
| -1.340999999999913 | -11.162 | -1.798 | -0.434 |
| -1.336499999999913 | -11.132 | -1.786 | -0.44 |
| -1.331999999999913 | -11.102 | -1.774 | -0.446 |
| -1.327499999999913 | -11.072 | -1.762 | -0.452 |
| -1.322999999999913 | -11.042 | -1.75 | -0.458 |
| -1.318499999999913 | -11.012 | -1.738 | -0.464 |
| -1.313999999999913 | -10.983 | -1.727 | -0.471 |
| -1.309499999999913 | -10.953 | -1.715 | -0.477 |
| -1.304999999999913 | -10.923 | -1.703 | -0.483 |
| -1.300499999999913 | -10.893 | -1.691 | -0.489 |
| -1.295999999999913 | -10.864 | -1.68 | -0.496 |
| -1.291499999999913 | -10.834 | -1.668 | -0.502 |
| -1.286999999999914 | -10.804 | -1.656 | -0.508 |
| -1.282499999999914 | -10.775 | -1.645 | -0.515 |
| -1.277999999999914 | -10.745 | -1.633 | -0.521 |
| -1.273499999999914 | -10.716 | -1.622 | -0.528 |
| -1.268999999999914 | -10.686 | -1.61 | -0.534 |
| -1.264499999999914 | -10.657 | -1.599 | -0.541 |
| -1.259999999999914 | -10.628 | -1.588 | -0.548 |
| -1.255499999999914 | -10.598 | -1.576 | -0.554 |
| -1.250999999999914 | -10.569 | -1.565 | -0.561 |
| -1.246499999999914 | -10.54 | -1.554 | -0.568 |
| -1.241999999999914 | -10.511 | -1.543 | -0.575 |
| -1.237499999999914 | -10.481 | -1.531 | -0.581 |
| -1.232999999999914 | -10.452 | -1.52 | -0.588 |
| -1.228499999999914 | -10.423 | -1.509 | -0.595 |
| -1.223999999999914 | -10.394 | -1.498 | -0.602 |
| -1.219499999999914 | -10.365 | -1.487 | -0.609 |
| -1.214999999999914 | -10.336 | -1.476 | -0.616 |
| -1.210499999999914 | -10.307 | -1.465 | -0.623 |
| -1.205999999999914 | -10.278 | -1.454 | -0.63 |
| -1.201499999999915 | -10.25 | -1.444 | -0.638 |
| -1.196999999999915 | -10.221 | -1.433 | -0.645 |
| -1.192499999999915 | -10.192 | -1.422 | -0.652 |
| -1.187999999999915 | -10.163 | -1.411 | -0.659 |
| -1.183499999999915 | -10.135 | -1.401 | -0.667 |
| -1.178999999999915 | -10.106 | -1.39 | -0.674 |
| -1.174499999999915 | -10.077 | -1.379 | -0.681 |
| -1.169999999999915 | -10.049 | -1.369 | -0.689 |
| -1.165499999999915 | -10.02 | -1.358 | -0.696 |
| -1.160999999999915 | -9.992 | -1.348 | -0.704 |
| -1.156499999999915 | -9.963 | -1.337 | -0.711 |
| -1.151999999999915 | -9.935 | -1.327 | -0.719 |
| -1.147499999999915 | -9.907 | -1.317 | -0.727 |
| -1.142999999999915 | -9.878 | -1.306 | -0.734 |
| -1.138499999999915 | -9.85 | -1.296 | -0.742 |
| -1.133999999999915 | -9.822 | -1.286 | -0.75 |
| -1.129499999999915 | -9.794 | -1.276 | -0.758 |
| -1.124999999999915 | -9.766 | -1.266 | -0.766 |
| -1.120499999999915 | -9.738 | -1.256 | -0.774 |
| -1.115999999999915 | -9.709 | -1.245 | -0.781 |
| -1.111499999999916 | -9.681 | -1.235 | -0.789 |
| -1.106999999999916 | -9.653 | -1.225 | -0.797 |
| -1.102499999999916 | -9.626 | -1.216 | -0.806 |
| -1.097999999999916 | -9.598 | -1.206 | -0.814 |
| -1.093499999999916 | -9.57 | -1.196 | -0.822 |
| -1.088999999999916 | -9.542 | -1.186 | -0.83 |
| -1.084499999999916 | -9.514 | -1.176 | -0.838 |
| -1.079999999999916 | -9.486 | -1.166 | -0.846 |
| -1.075499999999916 | -9.459 | -1.157 | -0.855 |
| -1.070999999999916 | -9.431 | -1.147 | -0.863 |
| -1.066499999999916 | -9.403 | -1.137 | -0.871 |
| -1.061999999999916 | -9.376 | -1.128 | -0.88 |
| -1.057499999999916 | -9.348 | -1.118 | -0.888 |
| -1.052999999999916 | -9.321 | -1.109 | -0.897 |
| -1.048499999999916 | -9.293 | -1.099 | -0.905 |
| -1.043999999999916 | -9.266 | -1.09 | -0.914 |
| -1.039499999999916 | -9.239 | -1.081 | -0.923 |
| -1.034999999999916 | -9.211 | -1.071 | -0.931 |
| -1.030499999999916 | -9.184 | -1.062 | -0.94 |
| -1.025999999999917 | -9.157 | -1.053 | -0.949 |
| -1.021499999999917 | -9.129 | -1.043 | -0.957 |
| -1.016999999999917 | -9.102 | -1.034 | -0.966 |
| -1.012499999999917 | -9.075 | -1.025 | -0.975 |
| -1.007999999999917 | -9.048 | -1.016 | -0.984 |
| -1.003499999999917 | -9.021 | -1.007 | -0.993 |
| -0.998999999999917 | -8.994 | -0.998 | -1.002 |
| -0.994499999999917 | -8.967 | -0.989 | -1.011 |
| -0.989999999999917 | -8.94 | -0.98 | -1.02 |
| -0.985499999999917 | -8.913 | -0.971 | -1.029 |
| -0.980999999999917 | -8.886 | -0.962 | -1.038 |
| -0.976499999999917 | -8.86 | -0.954 | -1.048 |
| -0.971999999999917 | -8.833 | -0.945 | -1.057 |
| -0.967499999999917 | -8.806 | -0.936 | -1.066 |
| -0.962999999999917 | -8.779 | -0.927 | -1.075 |
| -0.958499999999917 | -8.753 | -0.919 | -1.085 |
| -0.953999999999917 | -8.726 | -0.91 | -1.094 |
| -0.949499999999917 | -8.7 | -0.902 | -1.104 |
| -0.944999999999917 | -8.673 | -0.893 | -1.113 |
| -0.940499999999917 | -8.647 | -0.885 | -1.123 |
| -0.935999999999918 | -8.62 | -0.876 | -1.132 |
| -0.931499999999918 | -8.594 | -0.868 | -1.142 |
| -0.926999999999918 | -8.567 | -0.859 | -1.151 |
| -0.922499999999918 | -8.541 | -0.851 | -1.161 |
| -0.917999999999918 | -8.515 | -0.843 | -1.171 |
| -0.913499999999918 | -8.488 | -0.834 | -1.18 |
| -0.908999999999918 | -8.462 | -0.826 | -1.19 |
| -0.904499999999918 | -8.436 | -0.818 | -1.2 |
| -0.899999999999918 | -8.41 | -0.81 | -1.21 |
| -0.895499999999918 | -8.384 | -0.802 | -1.22 |
| -0.890999999999918 | -8.358 | -0.794 | -1.23 |
| -0.886499999999918 | -8.332 | -0.786 | -1.24 |
| -0.881999999999918 | -8.306 | -0.778 | -1.25 |
| -0.877499999999918 | -8.28 | -0.77 | -1.26 |
| -0.872999999999918 | -8.254 | -0.762 | -1.27 |
| -0.868499999999918 | -8.228 | -0.754 | -1.28 |
| -0.863999999999918 | -8.202 | -0.746 | -1.29 |
| -0.859499999999918 | -8.177 | -0.739 | -1.301 |
| -0.854999999999918 | -8.151 | -0.731 | -1.311 |
| -0.850499999999918 | -8.125 | -0.723 | -1.321 |
| -0.845999999999919 | -8.1 | -0.716 | -1.332 |
| -0.841499999999919 | -8.074 | -0.708 | -1.342 |
| -0.836999999999919 | -8.049 | -0.701 | -1.353 |
| -0.832499999999919 | -8.023 | -0.693 | -1.363 |
| -0.827999999999919 | -7.998 | -0.686 | -1.374 |
| -0.823499999999919 | -7.972 | -0.678 | -1.384 |
| -0.818999999999919 | -7.947 | -0.671 | -1.395 |
| -0.814499999999919 | -7.921 | -0.663 | -1.405 |
| -0.809999999999919 | -7.896 | -0.656 | -1.416 |
| -0.805499999999919 | -7.871 | -0.649 | -1.427 |
| -0.800999999999919 | -7.846 | -0.642 | -1.438 |
| -0.796499999999919 | -7.82 | -0.634 | -1.448 |
| -0.791999999999919 | -7.795 | -0.627 | -1.459 |
| -0.787499999999919 | -7.77 | -0.62 | -1.47 |
| -0.782999999999919 | -7.745 | -0.613 | -1.481 |
| -0.778499999999919 | -7.72 | -0.606 | -1.492 |
| -0.773999999999919 | -7.695 | -0.599 | -1.503 |
| -0.769499999999919 | -7.67 | -0.592 | -1.514 |
| -0.764999999999919 | -7.645 | -0.585 | -1.525 |
| -0.760499999999919 | -7.62 | -0.578 | -1.536 |
| -0.75599999999992 | -7.596 | -0.572 | -1.548 |
| -0.75149999999992 | -7.571 | -0.565 | -1.559 |
| -0.74699999999992 | -7.546 | -0.558 | -1.57 |
| -0.74249999999992 | -7.521 | -0.551 | -1.581 |
| -0.73799999999992 | -7.497 | -0.545 | -1.593 |
| -0.73349999999992 | -7.472 | -0.538 | -1.604 |
| -0.72899999999992 | -7.447 | -0.531 | -1.615 |
| -0.72449999999992 | -7.423 | -0.525 | -1.627 |
| -0.71999999999992 | -7.398 | -0.518 | -1.638 |
| -0.71549999999992 | -7.374 | -0.512 | -1.65 |
| -0.71099999999992 | -7.35 | -0.506 | -1.662 |
| -0.70649999999992 | -7.325 | -0.499 | -1.673 |
| -0.70199999999992 | -7.301 | -0.493 | -1.685 |
| -0.69749999999992 | -7.277 | -0.487 | -1.697 |
| -0.69299999999992 | -7.252 | -0.48 | -1.708 |
| -0.68849999999992 | -7.228 | -0.474 | -1.72 |
| -0.68399999999992 | -7.204 | -0.468 | -1.732 |
| -0.67949999999992 | -7.18 | -0.462 | -1.744 |
| -0.67499999999992 | -7.156 | -0.456 | -1.756 |
| -0.670499999999921 | -7.132 | -0.45 | -1.768 |
| -0.665999999999921 | -7.108 | -0.444 | -1.78 |
| -0.661499999999921 | -7.084 | -0.438 | -1.792 |
| -0.656999999999921 | -7.06 | -0.432 | -1.804 |
| -0.652499999999921 | -7.036 | -0.426 | -1.816 |
| -0.647999999999921 | -7.012 | -0.42 | -1.828 |
| -0.643499999999921 | -6.988 | -0.414 | -1.84 |
| -0.638999999999921 | -6.964 | -0.408 | -1.852 |
| -0.634499999999921 | -6.941 | -0.403 | -1.865 |
| -0.629999999999921 | -6.917 | -0.397 | -1.877 |
| -0.625499999999921 | -6.893 | -0.391 | -1.889 |
| -0.620999999999921 | -6.87 | -0.386 | -1.902 |
| -0.616499999999921 | -6.846 | -0.38 | -1.914 |
| -0.611999999999921 | -6.823 | -0.375 | -1.927 |
| -0.607499999999921 | -6.799 | -0.369 | -1.939 |
| -0.602999999999921 | -6.776 | -0.364 | -1.952 |
| -0.598499999999921 | -6.752 | -0.358 | -1.964 |
| -0.593999999999921 | -6.729 | -0.353 | -1.977 |
| -0.589499999999922 | -6.706 | -0.348 | -1.99 |
| -0.584999999999922 | -6.682 | -0.342 | -2.002 |
| -0.580499999999922 | -6.659 | -0.337 | -2.015 |
| -0.575999999999922 | -6.636 | -0.332 | -2.028 |
| -0.571499999999922 | -6.613 | -0.327 | -2.041 |
| -0.566999999999922 | -6.589 | -0.321 | -2.053 |
| -0.562499999999922 | -6.566 | -0.316 | -2.066 |
| -0.557999999999922 | -6.543 | -0.311 | -2.079 |
| -0.553499999999922 | -6.52 | -0.306 | -2.092 |
| -0.548999999999922 | -6.497 | -0.301 | -2.105 |
| -0.544499999999922 | -6.474 | -0.296 | -2.118 |
| -0.539999999999922 | -6.452 | -0.292 | -2.132 |
| -0.535499999999922 | -6.429 | -0.287 | -2.145 |
| -0.530999999999922 | -6.406 | -0.282 | -2.158 |
| -0.526499999999922 | -6.383 | -0.277 | -2.171 |
| -0.521999999999922 | -6.36 | -0.272 | -2.184 |
| -0.517499999999922 | -6.338 | -0.268 | -2.198 |
| -0.512999999999922 | -6.315 | -0.263 | -2.211 |
| -0.508499999999922 | -6.293 | -0.259 | -2.225 |
| -0.503999999999923 | -6.27 | -0.254 | -2.238 |
| -0.499499999999922 | -6.248 | -0.25 | -2.252 |
| -0.494999999999922 | -6.225 | -0.245 | -2.265 |
| -0.490499999999922 | -6.203 | -0.241 | -2.279 |
| -0.485999999999922 | -6.18 | -0.236 | -2.292 |
| -0.481499999999922 | -6.158 | -0.232 | -2.306 |
| -0.476999999999922 | -6.136 | -0.228 | -2.32 |
| -0.472499999999922 | -6.113 | -0.223 | -2.333 |
| -0.467999999999922 | -6.091 | -0.219 | -2.347 |
| -0.463499999999922 | -6.069 | -0.215 | -2.361 |
| -0.458999999999922 | -6.047 | -0.211 | -2.375 |
| -0.454499999999922 | -6.025 | -0.207 | -2.389 |
| -0.449999999999922 | -6.002 | -0.202 | -2.403 |
| -0.445499999999922 | -5.98 | -0.198 | -2.416 |
| -0.440999999999922 | -5.958 | -0.194 | -2.43 |
| -0.436499999999922 | -5.937 | -0.191 | -2.445 |
| -0.431999999999922 | -5.915 | -0.187 | -2.459 |
| -0.427499999999922 | -5.893 | -0.183 | -2.473 |
| -0.422999999999922 | -5.871 | -0.179 | -2.487 |
| -0.418499999999922 | -5.849 | -0.175 | -2.501 |
| -0.413999999999922 | -5.827 | -0.171 | -2.515 |
| -0.409499999999922 | -5.806 | -0.168 | -2.53 |
| -0.404999999999922 | -5.784 | -0.164 | -2.544 |
| -0.400499999999922 | -5.762 | -0.16 | -2.558 |
| -0.395999999999922 | -5.741 | -0.157 | -2.573 |
| -0.391499999999922 | -5.719 | -0.153 | -2.587 |
| -0.386999999999922 | -5.698 | -0.15 | -2.602 |
| -0.382499999999922 | -5.676 | -0.146 | -2.616 |
| -0.377999999999922 | -5.655 | -0.143 | -2.631 |
| -0.373499999999922 | -5.634 | -0.14 | -2.646 |
| -0.368999999999922 | -5.612 | -0.136 | -2.66 |
| -0.364499999999922 | -5.591 | -0.133 | -2.675 |
| -0.359999999999922 | -5.57 | -0.13 | -2.69 |
| -0.355499999999922 | -5.548 | -0.126 | -2.704 |
| -0.350999999999922 | -5.527 | -0.123 | -2.719 |
| -0.346499999999922 | -5.506 | -0.12 | -2.734 |
| -0.341999999999922 | -5.485 | -0.117 | -2.749 |
| -0.337499999999922 | -5.464 | -0.114 | -2.764 |
| -0.332999999999922 | -5.443 | -0.111 | -2.779 |
| -0.328499999999922 | -5.422 | -0.108 | -2.794 |
| -0.323999999999922 | -5.401 | -0.105 | -2.809 |
| -0.319499999999922 | -5.38 | -0.102 | -2.824 |
| -0.314999999999922 | -5.359 | -0.099 | -2.839 |
| -0.310499999999922 | -5.338 | -0.096 | -2.854 |
| -0.305999999999922 | -5.318 | -0.094 | -2.87 |
| -0.301499999999922 | -5.297 | -0.091 | -2.885 |
| -0.296999999999922 | -5.276 | -0.088 | -2.9 |
| -0.292499999999922 | -5.256 | -0.086 | -2.916 |
| -0.287999999999922 | -5.235 | -0.083 | -2.931 |
| -0.283499999999922 | -5.214 | -0.08 | -2.946 |
| -0.278999999999922 | -5.194 | -0.078 | -2.962 |
| -0.274499999999922 | -5.173 | -0.075 | -2.977 |
| -0.269999999999922 | -5.153 | -0.073 | -2.993 |
| -0.265499999999922 | -5.132 | -0.07 | -3.008 |
| -0.260999999999922 | -5.112 | -0.068 | -3.024 |
| -0.256499999999922 | -5.092 | -0.066 | -3.04 |
| -0.251999999999922 | -5.072 | -0.064 | -3.056 |
| -0.247499999999922 | -5.051 | -0.061 | -3.071 |
| -0.242999999999922 | -5.031 | -0.059 | -3.087 |
| -0.238499999999922 | -5.011 | -0.057 | -3.103 |
| -0.233999999999922 | -4.991 | -0.055 | -3.119 |
| -0.229499999999922 | -4.971 | -0.053 | -3.135 |
| -0.224999999999922 | -4.951 | -0.051 | -3.151 |
| -0.220499999999922 | -4.931 | -0.049 | -3.167 |
| -0.215999999999922 | -4.911 | -0.047 | -3.183 |
| -0.211499999999922 | -4.891 | -0.045 | -3.199 |
| -0.206999999999922 | -4.871 | -0.043 | -3.215 |
| -0.202499999999922 | -4.851 | -0.041 | -3.231 |
| -0.197999999999922 | -4.831 | -0.039 | -3.247 |
| -0.193499999999922 | -4.811 | -0.037 | -3.263 |
| -0.188999999999922 | -4.792 | -0.036 | -3.28 |
| -0.184499999999922 | -4.772 | -0.034 | -3.296 |
| -0.179999999999922 | -4.752 | -0.032 | -3.312 |
| -0.175499999999922 | -4.733 | -0.031 | -3.329 |
| -0.170999999999922 | -4.713 | -0.029 | -3.345 |
| -0.166499999999922 | -4.694 | -0.028 | -3.362 |
| -0.161999999999922 | -4.674 | -0.026 | -3.378 |
| -0.157499999999922 | -4.655 | -0.025 | -3.395 |
| -0.152999999999922 | -4.635 | -0.023 | -3.411 |
| -0.148499999999922 | -4.616 | -0.022 | -3.428 |
| -0.143999999999922 | -4.597 | -0.021 | -3.445 |
| -0.139499999999922 | -4.577 | -0.019 | -3.461 |
| -0.134999999999922 | -4.558 | -0.018 | -3.478 |
| -0.130499999999922 | -4.539 | -0.017 | -3.495 |
| -0.125999999999922 | -4.52 | -0.016 | -3.512 |
| -0.121499999999922 | -4.501 | -0.015 | -3.529 |
| -0.116999999999922 | -4.482 | -0.014 | -3.546 |
| -0.112499999999922 | -4.463 | -0.013 | -3.563 |
| -0.107999999999922 | -4.444 | -0.012 | -3.58 |
| -0.103499999999922 | -4.425 | -0.011 | -3.597 |
| -0.0989999999999221 | -4.406 | -0.01 | -3.614 |
| -0.0944999999999221 | -4.387 | -0.009 | -3.631 |
| -0.0899999999999221 | -4.368 | -0.008 | -3.648 |
| -0.0854999999999221 | -4.349 | -0.007 | -3.665 |
| -0.0809999999999221 | -4.331 | -0.007 | -3.683 |
| -0.0764999999999221 | -4.312 | -0.006 | -3.7 |
| -0.0719999999999221 | -4.293 | -0.005 | -3.717 |
| -0.0674999999999221 | -4.275 | -0.005 | -3.735 |
| -0.0629999999999221 | -4.256 | -0.004 | -3.752 |
| -0.0584999999999221 | -4.237 | -0.003 | -3.769 |
| -0.0539999999999221 | -4.219 | -0.003 | -3.787 |
| -0.0494999999999221 | -4.2 | -0.002 | -3.804 |
| -0.0449999999999221 | -4.182 | -0.002 | -3.822 |
| -0.0404999999999221 | -4.164 | -0.002 | -3.84 |
| -0.0359999999999221 | -4.145 | -0.001 | -3.857 |
| -0.0314999999999221 | -4.127 | -0.001 | -3.875 |
| -0.0269999999999221 | -4.109 | -0.001 | -3.893 |
| -0.0224999999999221 | -4.091 | -0.001 | -3.911 |
| -0.0179999999999221 | -4.072 | 0 | -3.928 |
| -0.0134999999999221 | -4.054 | 0 | -3.946 |
| -0.00899999999992213 | -4.036 | 0 | -3.964 |
| -0.00449999999992214 | -4.018 | 0 | -3.982 |
| 7.7863063219219e-14 | -4 | 0 | -4 |
| 0.00450000000007786 | -3.982 | 0 | -4.018 |
| 0.00900000000007786 | -3.964 | 0 | -4.036 |
| 0.0135000000000779 | -3.946 | 0 | -4.054 |
| 0.0180000000000779 | -3.928 | 0 | -4.072 |
| 0.0225000000000779 | -3.911 | -0.001 | -4.091 |
| 0.0270000000000779 | -3.893 | -0.001 | -4.109 |
| 0.0315000000000779 | -3.875 | -0.001 | -4.127 |
| 0.0360000000000779 | -3.857 | -0.001 | -4.145 |
| 0.0405000000000778 | -3.84 | -0.002 | -4.164 |
| 0.0450000000000778 | -3.822 | -0.002 | -4.182 |
| 0.0495000000000778 | -3.804 | -0.002 | -4.2 |
| 0.0540000000000778 | -3.787 | -0.003 | -4.219 |
| 0.0585000000000778 | -3.769 | -0.003 | -4.237 |
| 0.0630000000000778 | -3.752 | -0.004 | -4.256 |
| 0.0675000000000778 | -3.735 | -0.005 | -4.275 |
| 0.0720000000000778 | -3.717 | -0.005 | -4.293 |
| 0.0765000000000778 | -3.7 | -0.006 | -4.312 |
| 0.0810000000000778 | -3.683 | -0.007 | -4.331 |
| 0.0855000000000778 | -3.665 | -0.007 | -4.349 |
| 0.0900000000000778 | -3.648 | -0.008 | -4.368 |
| 0.0945000000000778 | -3.631 | -0.009 | -4.387 |
| 0.0990000000000778 | -3.614 | -0.01 | -4.406 |
| 0.103500000000078 | -3.597 | -0.011 | -4.425 |
| 0.108000000000078 | -3.58 | -0.012 | -4.444 |
| 0.112500000000078 | -3.563 | -0.013 | -4.463 |
| 0.117000000000078 | -3.546 | -0.014 | -4.482 |
| 0.121500000000078 | -3.529 | -0.015 | -4.501 |
| 0.126000000000078 | -3.512 | -0.016 | -4.52 |
| 0.130500000000078 | -3.495 | -0.017 | -4.539 |
| 0.135000000000078 | -3.478 | -0.018 | -4.558 |
| 0.139500000000078 | -3.461 | -0.019 | -4.577 |
| 0.144000000000078 | -3.445 | -0.021 | -4.597 |
| 0.148500000000078 | -3.428 | -0.022 | -4.616 |
| 0.153000000000078 | -3.411 | -0.023 | -4.635 |
| 0.157500000000078 | -3.395 | -0.025 | -4.655 |
| 0.162000000000078 | -3.378 | -0.026 | -4.674 |
| 0.166500000000078 | -3.362 | -0.028 | -4.694 |
| 0.171000000000078 | -3.345 | -0.029 | -4.713 |
| 0.175500000000078 | -3.329 | -0.031 | -4.733 |
| 0.180000000000078 | -3.312 | -0.032 | -4.752 |
| 0.184500000000078 | -3.296 | -0.034 | -4.772 |
| 0.189000000000078 | -3.28 | -0.036 | -4.792 |
| 0.193500000000078 | -3.263 | -0.037 | -4.811 |
| 0.198000000000078 | -3.247 | -0.039 | -4.831 |
| 0.202500000000078 | -3.231 | -0.041 | -4.851 |
| 0.207000000000078 | -3.215 | -0.043 | -4.871 |
| 0.211500000000078 | -3.199 | -0.045 | -4.891 |
| 0.216000000000078 | -3.183 | -0.047 | -4.911 |
| 0.220500000000078 | -3.167 | -0.049 | -4.931 |
| 0.225000000000078 | -3.151 | -0.051 | -4.951 |
| 0.229500000000078 | -3.135 | -0.053 | -4.971 |
| 0.234000000000078 | -3.119 | -0.055 | -4.991 |
| 0.238500000000078 | -3.103 | -0.057 | -5.011 |
| 0.243000000000078 | -3.087 | -0.059 | -5.031 |
| 0.247500000000078 | -3.071 | -0.061 | -5.051 |
| 0.252000000000078 | -3.056 | -0.064 | -5.072 |
| 0.256500000000078 | -3.04 | -0.066 | -5.092 |
| 0.261000000000078 | -3.024 | -0.068 | -5.112 |
| 0.265500000000078 | -3.008 | -0.07 | -5.132 |
| 0.270000000000078 | -2.993 | -0.073 | -5.153 |
| 0.274500000000078 | -2.977 | -0.075 | -5.173 |
| 0.279000000000078 | -2.962 | -0.078 | -5.194 |
| 0.283500000000078 | -2.946 | -0.08 | -5.214 |
| 0.288000000000078 | -2.931 | -0.083 | -5.235 |
| 0.292500000000078 | -2.916 | -0.086 | -5.256 |
| 0.297000000000078 | -2.9 | -0.088 | -5.276 |
| 0.301500000000078 | -2.885 | -0.091 | -5.297 |
| 0.306000000000078 | -2.87 | -0.094 | -5.318 |
| 0.310500000000078 | -2.854 | -0.096 | -5.338 |
| 0.315000000000078 | -2.839 | -0.099 | -5.359 |
| 0.319500000000078 | -2.824 | -0.102 | -5.38 |
| 0.324000000000078 | -2.809 | -0.105 | -5.401 |
| 0.328500000000078 | -2.794 | -0.108 | -5.422 |
| 0.333000000000078 | -2.779 | -0.111 | -5.443 |
| 0.337500000000078 | -2.764 | -0.114 | -5.464 |
| 0.342000000000078 | -2.749 | -0.117 | -5.485 |
| 0.346500000000078 | -2.734 | -0.12 | -5.506 |
| 0.351000000000078 | -2.719 | -0.123 | -5.527 |
| 0.355500000000078 | -2.704 | -0.126 | -5.548 |
| 0.360000000000078 | -2.69 | -0.13 | -5.57 |
| 0.364500000000078 | -2.675 | -0.133 | -5.591 |
| 0.369000000000078 | -2.66 | -0.136 | -5.612 |
| 0.373500000000078 | -2.646 | -0.14 | -5.634 |
| 0.378000000000078 | -2.631 | -0.143 | -5.655 |
| 0.382500000000078 | -2.616 | -0.146 | -5.676 |
| 0.387000000000078 | -2.602 | -0.15 | -5.698 |
| 0.391500000000078 | -2.587 | -0.153 | -5.719 |
| 0.396000000000078 | -2.573 | -0.157 | -5.741 |
| 0.400500000000078 | -2.558 | -0.16 | -5.762 |
| 0.405000000000078 | -2.544 | -0.164 | -5.784 |
| 0.409500000000078 | -2.53 | -0.168 | -5.806 |
| 0.414000000000078 | -2.515 | -0.171 | -5.827 |
| 0.418500000000078 | -2.501 | -0.175 | -5.849 |
| 0.423000000000078 | -2.487 | -0.179 | -5.871 |
| 0.427500000000078 | -2.473 | -0.183 | -5.893 |
| 0.432000000000078 | -2.459 | -0.187 | -5.915 |
| 0.436500000000078 | -2.445 | -0.191 | -5.937 |
| 0.441000000000078 | -2.43 | -0.194 | -5.958 |
| 0.445500000000078 | -2.416 | -0.198 | -5.98 |
| 0.450000000000078 | -2.402 | -0.203 | -6.003 |
| 0.454500000000078 | -2.389 | -0.207 | -6.025 |
| 0.459000000000078 | -2.375 | -0.211 | -6.047 |
| 0.463500000000078 | -2.361 | -0.215 | -6.069 |
| 0.468000000000078 | -2.347 | -0.219 | -6.091 |
| 0.472500000000078 | -2.333 | -0.223 | -6.113 |
| 0.477000000000078 | -2.32 | -0.228 | -6.136 |
| 0.481500000000078 | -2.306 | -0.232 | -6.158 |
| 0.486000000000078 | -2.292 | -0.236 | -6.18 |
| 0.490500000000078 | -2.279 | -0.241 | -6.203 |
| 0.495000000000078 | -2.265 | -0.245 | -6.225 |
| 0.499500000000078 | -2.252 | -0.25 | -6.248 |
| 0.504000000000078 | -2.238 | -0.254 | -6.27 |
| 0.508500000000078 | -2.225 | -0.259 | -6.293 |
| 0.513000000000078 | -2.211 | -0.263 | -6.315 |
| 0.517500000000078 | -2.198 | -0.268 | -6.338 |
| 0.522000000000078 | -2.184 | -0.272 | -6.36 |
| 0.526500000000078 | -2.171 | -0.277 | -6.383 |
| 0.531000000000078 | -2.158 | -0.282 | -6.406 |
| 0.535500000000078 | -2.145 | -0.287 | -6.429 |
| 0.540000000000078 | -2.132 | -0.292 | -6.452 |
| 0.544500000000078 | -2.118 | -0.296 | -6.474 |
| 0.549000000000078 | -2.105 | -0.301 | -6.497 |
| 0.553500000000078 | -2.092 | -0.306 | -6.52 |
| 0.558000000000078 | -2.079 | -0.311 | -6.543 |
| 0.562500000000077 | -2.066 | -0.316 | -6.566 |
| 0.567000000000077 | -2.053 | -0.321 | -6.589 |
| 0.571500000000077 | -2.041 | -0.327 | -6.613 |
| 0.576000000000077 | -2.028 | -0.332 | -6.636 |
| 0.580500000000077 | -2.015 | -0.337 | -6.659 |
| 0.585000000000077 | -2.002 | -0.342 | -6.682 |
| 0.589500000000077 | -1.99 | -0.348 | -6.706 |
| 0.594000000000077 | -1.977 | -0.353 | -6.729 |
| 0.598500000000077 | -1.964 | -0.358 | -6.752 |
| 0.603000000000077 | -1.952 | -0.364 | -6.776 |
| 0.607500000000077 | -1.939 | -0.369 | -6.799 |
| 0.612000000000077 | -1.927 | -0.375 | -6.823 |
| 0.616500000000077 | -1.914 | -0.38 | -6.846 |
| 0.621000000000077 | -1.902 | -0.386 | -6.87 |
| 0.625500000000077 | -1.889 | -0.391 | -6.893 |
| 0.630000000000077 | -1.877 | -0.397 | -6.917 |
| 0.634500000000077 | -1.865 | -0.403 | -6.941 |
| 0.639000000000077 | -1.852 | -0.408 | -6.964 |
| 0.643500000000076 | -1.84 | -0.414 | -6.988 |
| 0.648000000000076 | -1.828 | -0.42 | -7.012 |
| 0.652500000000076 | -1.816 | -0.426 | -7.036 |
| 0.657000000000076 | -1.804 | -0.432 | -7.06 |
| 0.661500000000076 | -1.792 | -0.438 | -7.084 |
| 0.666000000000076 | -1.78 | -0.444 | -7.108 |
| 0.670500000000076 | -1.768 | -0.45 | -7.132 |
| 0.675000000000076 | -1.756 | -0.456 | -7.156 |
| 0.679500000000076 | -1.744 | -0.462 | -7.18 |
| 0.684000000000076 | -1.732 | -0.468 | -7.204 |
| 0.688500000000076 | -1.72 | -0.474 | -7.228 |
| 0.693000000000076 | -1.708 | -0.48 | -7.252 |
| 0.697500000000076 | -1.697 | -0.487 | -7.277 |
| 0.702000000000076 | -1.685 | -0.493 | -7.301 |
| 0.706500000000076 | -1.673 | -0.499 | -7.325 |
| 0.711000000000076 | -1.662 | -0.506 | -7.35 |
| 0.715500000000076 | -1.65 | -0.512 | -7.374 |
| 0.720000000000076 | -1.638 | -0.518 | -7.398 |
| 0.724500000000076 | -1.627 | -0.525 | -7.423 |
| 0.729000000000076 | -1.615 | -0.531 | -7.447 |
| 0.733500000000075 | -1.604 | -0.538 | -7.472 |
| 0.738000000000075 | -1.593 | -0.545 | -7.497 |
| 0.742500000000075 | -1.581 | -0.551 | -7.521 |
| 0.747000000000075 | -1.57 | -0.558 | -7.546 |
| 0.751500000000075 | -1.559 | -0.565 | -7.571 |
| 0.756000000000075 | -1.548 | -0.572 | -7.596 |
| 0.760500000000075 | -1.536 | -0.578 | -7.62 |
| 0.765000000000075 | -1.525 | -0.585 | -7.645 |
| 0.769500000000075 | -1.514 | -0.592 | -7.67 |
| 0.774000000000075 | -1.503 | -0.599 | -7.695 |
| 0.778500000000075 | -1.492 | -0.606 | -7.72 |
| 0.783000000000075 | -1.481 | -0.613 | -7.745 |
| 0.787500000000075 | -1.47 | -0.62 | -7.77 |
| 0.792000000000075 | -1.459 | -0.627 | -7.795 |
| 0.796500000000075 | -1.448 | -0.634 | -7.82 |
| 0.801000000000075 | -1.438 | -0.642 | -7.846 |
| 0.805500000000075 | -1.427 | -0.649 | -7.871 |
| 0.810000000000075 | -1.416 | -0.656 | -7.896 |
| 0.814500000000075 | -1.405 | -0.663 | -7.921 |
| 0.819000000000075 | -1.395 | -0.671 | -7.947 |
| 0.823500000000074 | -1.384 | -0.678 | -7.972 |
| 0.828000000000074 | -1.374 | -0.686 | -7.998 |
| 0.832500000000074 | -1.363 | -0.693 | -8.023 |
| 0.837000000000074 | -1.353 | -0.701 | -8.049 |
| 0.841500000000074 | -1.342 | -0.708 | -8.074 |
| 0.846000000000074 | -1.332 | -0.716 | -8.1 |
| 0.850500000000074 | -1.321 | -0.723 | -8.125 |
| 0.855000000000074 | -1.311 | -0.731 | -8.151 |
| 0.859500000000074 | -1.301 | -0.739 | -8.177 |
| 0.864000000000074 | -1.29 | -0.746 | -8.202 |
| 0.868500000000074 | -1.28 | -0.754 | -8.228 |
| 0.873000000000074 | -1.27 | -0.762 | -8.254 |
| 0.877500000000074 | -1.26 | -0.77 | -8.28 |
| 0.882000000000074 | -1.25 | -0.778 | -8.306 |
| 0.886500000000074 | -1.24 | -0.786 | -8.332 |
| 0.891000000000074 | -1.23 | -0.794 | -8.358 |
| 0.895500000000074 | -1.22 | -0.802 | -8.384 |
| 0.900000000000074 | -1.21 | -0.81 | -8.41 |
| 0.904500000000074 | -1.2 | -0.818 | -8.436 |
| 0.909000000000074 | -1.19 | -0.826 | -8.462 |
| 0.913500000000073 | -1.18 | -0.834 | -8.488 |
| 0.918000000000073 | -1.171 | -0.843 | -8.515 |
| 0.922500000000073 | -1.161 | -0.851 | -8.541 |
| 0.927000000000073 | -1.151 | -0.859 | -8.567 |
| 0.931500000000073 | -1.142 | -0.868 | -8.594 |
| 0.936000000000073 | -1.132 | -0.876 | -8.62 |
| 0.940500000000073 | -1.123 | -0.885 | -8.647 |
| 0.945000000000073 | -1.113 | -0.893 | -8.673 |
| 0.949500000000073 | -1.104 | -0.902 | -8.7 |
| 0.954000000000073 | -1.094 | -0.91 | -8.726 |
| 0.958500000000073 | -1.085 | -0.919 | -8.753 |
| 0.963000000000073 | -1.075 | -0.927 | -8.779 |
| 0.967500000000073 | -1.066 | -0.936 | -8.806 |
| 0.972000000000073 | -1.057 | -0.945 | -8.833 |
| 0.976500000000073 | -1.048 | -0.954 | -8.86 |
| 0.981000000000073 | -1.038 | -0.962 | -8.886 |
| 0.985500000000073 | -1.029 | -0.971 | -8.913 |
| 0.990000000000073 | -1.02 | -0.98 | -8.94 |
| 0.994500000000073 | -1.011 | -0.989 | -8.967 |
| 0.999000000000072 | -1.002 | -0.998 | -8.994 |
| 1.003500000000072 | -0.993 | -1.007 | -9.021 |
| 1.008000000000072 | -0.984 | -1.016 | -9.048 |
| 1.012500000000072 | -0.975 | -1.025 | -9.075 |
| 1.017000000000072 | -0.966 | -1.034 | -9.102 |
| 1.021500000000072 | -0.957 | -1.043 | -9.129 |
| 1.026000000000072 | -0.949 | -1.053 | -9.157 |
| 1.030500000000072 | -0.94 | -1.062 | -9.184 |
| 1.035000000000072 | -0.931 | -1.071 | -9.211 |
| 1.039500000000072 | -0.923 | -1.081 | -9.239 |
| 1.044000000000072 | -0.914 | -1.09 | -9.266 |
| 1.048500000000072 | -0.905 | -1.099 | -9.293 |
| 1.053000000000072 | -0.897 | -1.109 | -9.321 |
| 1.057500000000072 | -0.888 | -1.118 | -9.348 |
| 1.062000000000072 | -0.88 | -1.128 | -9.376 |
| 1.066500000000072 | -0.871 | -1.137 | -9.403 |
| 1.071000000000072 | -0.863 | -1.147 | -9.431 |
| 1.075500000000072 | -0.855 | -1.157 | -9.459 |
| 1.080000000000072 | -0.846 | -1.166 | -9.486 |
| 1.084500000000072 | -0.838 | -1.176 | -9.514 |
| 1.089000000000071 | -0.83 | -1.186 | -9.542 |
| 1.093500000000071 | -0.822 | -1.196 | -9.57 |
| 1.098000000000071 | -0.814 | -1.206 | -9.598 |
| 1.102500000000071 | -0.806 | -1.216 | -9.626 |
| 1.107000000000071 | -0.797 | -1.225 | -9.653 |
| 1.111500000000071 | -0.789 | -1.235 | -9.681 |
| 1.116000000000071 | -0.781 | -1.245 | -9.709 |
| 1.120500000000071 | -0.774 | -1.256 | -9.738 |
| 1.125000000000071 | -0.766 | -1.266 | -9.766 |
| 1.129500000000071 | -0.758 | -1.276 | -9.794 |
| 1.134000000000071 | -0.75 | -1.286 | -9.822 |
| 1.138500000000071 | -0.742 | -1.296 | -9.85 |
| 1.143000000000071 | -0.734 | -1.306 | -9.878 |
| 1.147500000000071 | -0.727 | -1.317 | -9.907 |
| 1.152000000000071 | -0.719 | -1.327 | -9.935 |
| 1.156500000000071 | -0.711 | -1.337 | -9.963 |
| 1.161000000000071 | -0.704 | -1.348 | -9.992 |
| 1.165500000000071 | -0.696 | -1.358 | -10.02 |
| 1.170000000000071 | -0.689 | -1.369 | -10.049 |
| 1.17450000000007 | -0.681 | -1.379 | -10.077 |
| 1.17900000000007 | -0.674 | -1.39 | -10.106 |
| 1.18350000000007 | -0.667 | -1.401 | -10.135 |
| 1.18800000000007 | -0.659 | -1.411 | -10.163 |
| 1.19250000000007 | -0.652 | -1.422 | -10.192 |
| 1.19700000000007 | -0.645 | -1.433 | -10.221 |
| 1.20150000000007 | -0.638 | -1.444 | -10.25 |
| 1.20600000000007 | -0.63 | -1.454 | -10.278 |
| 1.21050000000007 | -0.623 | -1.465 | -10.307 |
| 1.21500000000007 | -0.616 | -1.476 | -10.336 |
| 1.21950000000007 | -0.609 | -1.487 | -10.365 |
| 1.22400000000007 | -0.602 | -1.498 | -10.394 |
| 1.22850000000007 | -0.595 | -1.509 | -10.423 |
| 1.23300000000007 | -0.588 | -1.52 | -10.452 |
| 1.23750000000007 | -0.581 | -1.531 | -10.481 |
| 1.24200000000007 | -0.575 | -1.543 | -10.511 |
| 1.24650000000007 | -0.568 | -1.554 | -10.54 |
| 1.25100000000007 | -0.561 | -1.565 | -10.569 |
| 1.25550000000007 | -0.554 | -1.576 | -10.598 |
| 1.260000000000069 | -0.548 | -1.588 | -10.628 |
| 1.264500000000069 | -0.541 | -1.599 | -10.657 |
| 1.269000000000069 | -0.534 | -1.61 | -10.686 |
| 1.273500000000069 | -0.528 | -1.622 | -10.716 |
| 1.278000000000069 | -0.521 | -1.633 | -10.745 |
| 1.282500000000069 | -0.515 | -1.645 | -10.775 |
| 1.287000000000069 | -0.508 | -1.656 | -10.804 |
| 1.291500000000069 | -0.502 | -1.668 | -10.834 |
| 1.29600000000007 | -0.496 | -1.68 | -10.864 |
| 1.30050000000007 | -0.489 | -1.691 | -10.893 |
| 1.305000000000069 | -0.483 | -1.703 | -10.923 |
| 1.309500000000069 | -0.477 | -1.715 | -10.953 |
| 1.314000000000069 | -0.471 | -1.727 | -10.983 |
| 1.318500000000069 | -0.464 | -1.738 | -11.012 |
| 1.323000000000069 | -0.458 | -1.75 | -11.042 |
| 1.327500000000069 | -0.452 | -1.762 | -11.072 |
| 1.332000000000069 | -0.446 | -1.774 | -11.102 |
| 1.336500000000069 | -0.44 | -1.786 | -11.132 |
| 1.341000000000069 | -0.434 | -1.798 | -11.162 |
| 1.345500000000068 | -0.428 | -1.81 | -11.192 |
| 1.350000000000068 | -0.422 | -1.823 | -11.223 |
| 1.354500000000068 | -0.417 | -1.835 | -11.253 |
| 1.359000000000068 | -0.411 | -1.847 | -11.283 |
| 1.363500000000068 | -0.405 | -1.859 | -11.313 |
| 1.368000000000068 | -0.399 | -1.871 | -11.343 |
| 1.372500000000068 | -0.394 | -1.884 | -11.374 |
| 1.377000000000068 | -0.388 | -1.896 | -11.404 |
| 1.381500000000068 | -0.383 | -1.909 | -11.435 |
| 1.386000000000068 | -0.377 | -1.921 | -11.465 |
| 1.390500000000068 | -0.371 | -1.933 | -11.495 |
| 1.395000000000068 | -0.366 | -1.946 | -11.526 |
| 1.399500000000068 | -0.361 | -1.959 | -11.557 |
| 1.404000000000068 | -0.355 | -1.971 | -11.587 |
| 1.408500000000068 | -0.35 | -1.984 | -11.618 |
| 1.413000000000068 | -0.345 | -1.997 | -11.649 |
| 1.417500000000068 | -0.339 | -2.009 | -11.679 |
| 1.422000000000068 | -0.334 | -2.022 | -11.71 |
| 1.426500000000068 | -0.329 | -2.035 | -11.741 |
| 1.431000000000068 | -0.324 | -2.048 | -11.772 |
| 1.435500000000067 | -0.319 | -2.061 | -11.803 |
| 1.440000000000067 | -0.314 | -2.074 | -11.834 |
| 1.444500000000067 | -0.309 | -2.087 | -11.865 |
| 1.449000000000067 | -0.304 | -2.1 | -11.896 |
| 1.453500000000067 | -0.299 | -2.113 | -11.927 |
| 1.458000000000067 | -0.294 | -2.126 | -11.958 |
| 1.462500000000067 | -0.289 | -2.139 | -11.989 |
| 1.467000000000067 | -0.284 | -2.152 | -12.02 |
| 1.471500000000067 | -0.279 | -2.165 | -12.051 |
| 1.476000000000067 | -0.275 | -2.179 | -12.083 |
| 1.480500000000067 | -0.27 | -2.192 | -12.114 |
| 1.485000000000067 | -0.265 | -2.205 | -12.145 |
| 1.489500000000067 | -0.261 | -2.219 | -12.177 |
| 1.494000000000067 | -0.256 | -2.232 | -12.208 |
| 1.498500000000067 | -0.252 | -2.246 | -12.24 |
| 1.503000000000067 | -0.247 | -2.259 | -12.271 |
| 1.507500000000067 | -0.243 | -2.273 | -12.303 |
| 1.512000000000067 | -0.238 | -2.286 | -12.334 |
| 1.516500000000067 | -0.234 | -2.3 | -12.366 |
| 1.521000000000067 | -0.229 | -2.313 | -12.397 |
| 1.525500000000066 | -0.225 | -2.327 | -12.429 |
| 1.530000000000066 | -0.221 | -2.341 | -12.461 |
| 1.534500000000066 | -0.217 | -2.355 | -12.493 |
| 1.539000000000066 | -0.213 | -2.369 | -12.525 |
| 1.543500000000066 | -0.208 | -2.382 | -12.556 |
| 1.548000000000066 | -0.204 | -2.396 | -12.588 |
| 1.552500000000066 | -0.2 | -2.41 | -12.62 |
| 1.557000000000066 | -0.196 | -2.424 | -12.652 |
| 1.561500000000066 | -0.192 | -2.438 | -12.684 |
| 1.566000000000066 | -0.188 | -2.452 | -12.716 |
| 1.570500000000066 | -0.184 | -2.466 | -12.748 |
| 1.575000000000066 | -0.181 | -2.481 | -12.781 |
| 1.579500000000066 | -0.177 | -2.495 | -12.813 |
| 1.584000000000066 | -0.173 | -2.509 | -12.845 |
| 1.588500000000066 | -0.169 | -2.523 | -12.877 |
| 1.593000000000066 | -0.166 | -2.538 | -12.91 |
| 1.597500000000066 | -0.162 | -2.552 | -12.942 |
| 1.602000000000066 | -0.158 | -2.566 | -12.974 |
| 1.606500000000065 | -0.155 | -2.581 | -13.007 |
| 1.611000000000065 | -0.151 | -2.595 | -13.039 |
| 1.615500000000065 | -0.148 | -2.61 | -13.072 |
| 1.620000000000065 | -0.144 | -2.624 | -13.104 |
| 1.624500000000065 | -0.141 | -2.639 | -13.137 |
| 1.629000000000065 | -0.138 | -2.654 | -13.17 |
| 1.633500000000065 | -0.134 | -2.668 | -13.202 |
| 1.638000000000065 | -0.131 | -2.683 | -13.235 |
| 1.642500000000065 | -0.128 | -2.698 | -13.268 |
| 1.647000000000065 | -0.125 | -2.713 | -13.301 |
| 1.651500000000065 | -0.121 | -2.727 | -13.333 |
| 1.656000000000065 | -0.118 | -2.742 | -13.366 |
| 1.660500000000065 | -0.115 | -2.757 | -13.399 |
| 1.665000000000065 | -0.112 | -2.772 | -13.432 |
| 1.669500000000065 | -0.109 | -2.787 | -13.465 |
| 1.674000000000065 | -0.106 | -2.802 | -13.498 |
| 1.678500000000065 | -0.103 | -2.817 | -13.531 |
| 1.683000000000065 | -0.1 | -2.832 | -13.564 |
| 1.687500000000065 | -0.098 | -2.848 | -13.598 |
| 1.692000000000064 | -0.095 | -2.863 | -13.631 |
| 1.696500000000064 | -0.092 | -2.878 | -13.664 |
| 1.701000000000064 | -0.089 | -2.893 | -13.697 |
| 1.705500000000064 | -0.087 | -2.909 | -13.731 |
| 1.710000000000064 | -0.084 | -2.924 | -13.764 |
| 1.714500000000064 | -0.082 | -2.94 | -13.798 |
| 1.719000000000064 | -0.079 | -2.955 | -13.831 |
| 1.723500000000064 | -0.076 | -2.97 | -13.864 |
| 1.728000000000064 | -0.074 | -2.986 | -13.898 |
| 1.732500000000064 | -0.072 | -3.002 | -13.932 |
| 1.737000000000064 | -0.069 | -3.017 | -13.965 |
| 1.741500000000064 | -0.067 | -3.033 | -13.999 |
| 1.746000000000064 | -0.065 | -3.049 | -14.033 |
| 1.750500000000064 | -0.062 | -3.064 | -14.066 |
| 1.755000000000064 | -0.06 | -3.08 | -14.1 |
| 1.759500000000064 | -0.058 | -3.096 | -14.134 |
| 1.764000000000064 | -0.056 | -3.112 | -14.168 |
| 1.768500000000064 | -0.054 | -3.128 | -14.202 |
| 1.773000000000064 | -0.052 | -3.144 | -14.236 |
| 1.777500000000064 | -0.05 | -3.16 | -14.27 |
| 1.782000000000063 | -0.048 | -3.176 | -14.304 |
| 1.786500000000063 | -0.046 | -3.192 | -14.338 |
| 1.791000000000063 | -0.044 | -3.208 | -14.372 |
| 1.795500000000063 | -0.042 | -3.224 | -14.406 |
| 1.800000000000063 | -0.04 | -3.24 | -14.44 |
| 1.804500000000063 | -0.038 | -3.256 | -14.474 |
| 1.809000000000063 | -0.036 | -3.272 | -14.508 |
| 1.813500000000063 | -0.035 | -3.289 | -14.543 |
| 1.818000000000063 | -0.033 | -3.305 | -14.577 |
| 1.822500000000063 | -0.032 | -3.322 | -14.612 |
| 1.827000000000063 | -0.03 | -3.338 | -14.646 |
| 1.831500000000063 | -0.028 | -3.354 | -14.68 |
| 1.836000000000063 | -0.027 | -3.371 | -14.715 |
| 1.840500000000063 | -0.025 | -3.387 | -14.749 |
| 1.845000000000063 | -0.024 | -3.404 | -14.784 |
| 1.849500000000063 | -0.023 | -3.421 | -14.819 |
| 1.854000000000063 | -0.021 | -3.437 | -14.853 |
| 1.858500000000063 | -0.02 | -3.454 | -14.888 |
| 1.863000000000063 | -0.019 | -3.471 | -14.923 |
| 1.867500000000062 | -0.018 | -3.488 | -14.958 |
| 1.872000000000062 | -0.016 | -3.504 | -14.992 |
| 1.876500000000062 | -0.015 | -3.521 | -15.027 |
| 1.881000000000062 | -0.014 | -3.538 | -15.062 |
| 1.885500000000062 | -0.013 | -3.555 | -15.097 |
| 1.890000000000062 | -0.012 | -3.572 | -15.132 |
| 1.894500000000062 | -0.011 | -3.589 | -15.167 |
| 1.899000000000062 | -0.01 | -3.606 | -15.202 |
| 1.903500000000062 | -0.009 | -3.623 | -15.237 |
| 1.908000000000062 | -0.008 | -3.64 | -15.272 |
| 1.912500000000062 | -0.008 | -3.658 | -15.308 |
| 1.917000000000062 | -0.007 | -3.675 | -15.343 |
| 1.921500000000062 | -0.006 | -3.692 | -15.378 |
| 1.926000000000062 | -0.005 | -3.709 | -15.413 |
| 1.930500000000062 | -0.005 | -3.727 | -15.449 |
| 1.935000000000062 | -0.004 | -3.744 | -15.484 |
| 1.939500000000062 | -0.004 | -3.762 | -15.52 |
| 1.944000000000062 | -0.003 | -3.779 | -15.555 |
| 1.948500000000062 | -0.003 | -3.797 | -15.591 |
| 1.953000000000062 | -0.002 | -3.814 | -15.626 |
| 1.957500000000061 | -0.002 | -3.832 | -15.662 |
| 1.962000000000061 | -0.001 | -3.849 | -15.697 |
| 1.966500000000061 | -0.001 | -3.867 | -15.733 |
| 1.971000000000061 | -0.001 | -3.885 | -15.769 |
| 1.975500000000061 | -0.001 | -3.903 | -15.805 |
| 1.980000000000061 | 0 | -3.92 | -15.84 |
| 1.984500000000061 | 0 | -3.938 | -15.876 |
| 1.989000000000061 | 0 | -3.956 | -15.912 |
| 1.993500000000061 | 0 | -3.974 | -15.948 |
| 1.998000000000061 | 0 | -3.992 | -15.984 |
| 2.002500000000061 | 0 | -4.01 | -16.02 |
| 2.007000000000061 | 0 | -4.028 | -16.056 |
| 2.011500000000062 | 0 | -4.046 | -16.092 |
| 2.016000000000062 | 0 | -4.064 | -16.128 |
| 2.020500000000062 | 0 | -4.082 | -16.164 |
| 2.025000000000062 | -0.001 | -4.101 | -16.201 |
| 2.029500000000062 | -0.001 | -4.119 | -16.237 |
| 2.034000000000062 | -0.001 | -4.137 | -16.273 |
| 2.038500000000063 | -0.001 | -4.155 | -16.309 |
| 2.043000000000063 | -0.002 | -4.174 | -16.346 |
| 2.047500000000063 | -0.002 | -4.192 | -16.382 |
| 2.052000000000063 | -0.003 | -4.211 | -16.419 |
| 2.056500000000063 | -0.003 | -4.229 | -16.455 |
| 2.061000000000063 | -0.004 | -4.248 | -16.492 |
| 2.065500000000064 | -0.004 | -4.266 | -16.528 |
| 2.070000000000064 | -0.005 | -4.285 | -16.565 |
| 2.074500000000064 | -0.006 | -4.304 | -16.602 |
| 2.079000000000064 | -0.006 | -4.322 | -16.638 |
| 2.083500000000064 | -0.007 | -4.341 | -16.675 |
| 2.088000000000064 | -0.008 | -4.36 | -16.712 |
| 2.092500000000065 | -0.009 | -4.379 | -16.749 |
| 2.097000000000065 | -0.009 | -4.397 | -16.785 |
| 2.101500000000065 | -0.01 | -4.416 | -16.822 |
| 2.106000000000065 | -0.011 | -4.435 | -16.859 |
| 2.110500000000065 | -0.012 | -4.454 | -16.896 |
| 2.115000000000065 | -0.013 | -4.473 | -16.933 |
| 2.119500000000066 | -0.014 | -4.492 | -16.97 |
| 2.124000000000066 | -0.015 | -4.511 | -17.007 |
| 2.128500000000066 | -0.017 | -4.531 | -17.045 |
| 2.133000000000066 | -0.018 | -4.55 | -17.082 |
| 2.137500000000066 | -0.019 | -4.569 | -17.119 |
| 2.142000000000067 | -0.02 | -4.588 | -17.156 |
| 2.146500000000067 | -0.021 | -4.607 | -17.193 |
| 2.151000000000067 | -0.023 | -4.627 | -17.231 |
| 2.155500000000067 | -0.024 | -4.646 | -17.268 |
| 2.160000000000067 | -0.026 | -4.666 | -17.306 |
| 2.164500000000067 | -0.027 | -4.685 | -17.343 |
| 2.169000000000068 | -0.029 | -4.705 | -17.381 |
| 2.173500000000068 | -0.03 | -4.724 | -17.418 |
| 2.178000000000068 | -0.032 | -4.744 | -17.456 |
| 2.182500000000068 | -0.033 | -4.763 | -17.493 |
| 2.187000000000068 | -0.035 | -4.783 | -17.531 |
| 2.191500000000068 | -0.037 | -4.803 | -17.569 |
| 2.196000000000069 | -0.038 | -4.822 | -17.606 |
| 2.200500000000069 | -0.04 | -4.842 | -17.644 |
| 2.205000000000069 | -0.042 | -4.862 | -17.682 |
| 2.20950000000007 | -0.044 | -4.882 | -17.72 |
| 2.214000000000069 | -0.046 | -4.902 | -17.758 |
| 2.218500000000069 | -0.048 | -4.922 | -17.796 |
| 2.22300000000007 | -0.05 | -4.942 | -17.834 |
| 2.22750000000007 | -0.052 | -4.962 | -17.872 |
| 2.23200000000007 | -0.054 | -4.982 | -17.91 |
| 2.23650000000007 | -0.056 | -5.002 | -17.948 |
| 2.24100000000007 | -0.058 | -5.022 | -17.986 |
| 2.24550000000007 | -0.06 | -5.042 | -18.024 |
| 2.250000000000071 | -0.063 | -5.063 | -18.063 |
| 2.254500000000071 | -0.065 | -5.083 | -18.101 |
| 2.259000000000071 | -0.067 | -5.103 | -18.139 |
| 2.263500000000071 | -0.069 | -5.123 | -18.177 |
| 2.268000000000071 | -0.072 | -5.144 | -18.216 |
| 2.272500000000071 | -0.074 | -5.164 | -18.254 |
| 2.277000000000072 | -0.077 | -5.185 | -18.293 |
| 2.281500000000072 | -0.079 | -5.205 | -18.331 |
| 2.286000000000072 | -0.082 | -5.226 | -18.37 |
| 2.290500000000072 | -0.084 | -5.246 | -18.408 |
| 2.295000000000072 | -0.087 | -5.267 | -18.447 |
| 2.299500000000072 | -0.09 | -5.288 | -18.486 |
| 2.304000000000073 | -0.092 | -5.308 | -18.524 |
| 2.308500000000073 | -0.095 | -5.329 | -18.563 |
| 2.313000000000073 | -0.098 | -5.35 | -18.602 |
| 2.317500000000073 | -0.101 | -5.371 | -18.641 |
| 2.322000000000073 | -0.104 | -5.392 | -18.68 |
| 2.326500000000073 | -0.107 | -5.413 | -18.719 |
| 2.331000000000074 | -0.11 | -5.434 | -18.758 |
| 2.335500000000074 | -0.113 | -5.455 | -18.797 |
| 2.340000000000074 | -0.116 | -5.476 | -18.836 |
| 2.344500000000074 | -0.119 | -5.497 | -18.875 |
| 2.349000000000074 | -0.122 | -5.518 | -18.914 |
| 2.353500000000074 | -0.125 | -5.539 | -18.953 |
| 2.358000000000075 | -0.128 | -5.56 | -18.992 |
| 2.362500000000075 | -0.131 | -5.581 | -19.031 |
| 2.367000000000075 | -0.135 | -5.603 | -19.071 |
| 2.371500000000075 | -0.138 | -5.624 | -19.11 |
| 2.376000000000075 | -0.141 | -5.645 | -19.149 |
| 2.380500000000075 | -0.145 | -5.667 | -19.189 |
| 2.385000000000076 | -0.148 | -5.688 | -19.228 |
| 2.389500000000076 | -0.152 | -5.71 | -19.268 |
| 2.394000000000076 | -0.155 | -5.731 | -19.307 |
| 2.398500000000076 | -0.159 | -5.753 | -19.347 |
| 2.403000000000076 | -0.162 | -5.774 | -19.386 |
| 2.407500000000076 | -0.166 | -5.796 | -19.426 |
| 2.412000000000077 | -0.17 | -5.818 | -19.466 |
| 2.416500000000077 | -0.173 | -5.839 | -19.505 |
| 2.421000000000077 | -0.177 | -5.861 | -19.545 |
| 2.425500000000077 | -0.181 | -5.883 | -19.585 |
| 2.430000000000077 | -0.185 | -5.905 | -19.625 |
| 2.434500000000078 | -0.189 | -5.927 | -19.665 |
| 2.439000000000078 | -0.193 | -5.949 | -19.705 |
| 2.443500000000078 | -0.197 | -5.971 | -19.745 |
| 2.448000000000078 | -0.201 | -5.993 | -19.785 |
| 2.452500000000078 | -0.205 | -6.015 | -19.825 |
| 2.457000000000078 | -0.209 | -6.037 | -19.865 |
| 2.461500000000079 | -0.213 | -6.059 | -19.905 |
| 2.466000000000079 | -0.217 | -6.081 | -19.945 |
| 2.470500000000079 | -0.221 | -6.103 | -19.985 |
| 2.475000000000079 | -0.226 | -6.126 | -20.026 |
| 2.479500000000079 | -0.23 | -6.148 | -20.066 |
| 2.484000000000079 | -0.234 | -6.17 | -20.106 |
| 2.48850000000008 | -0.239 | -6.193 | -20.147 |
| 2.49300000000008 | -0.243 | -6.215 | -20.187 |
| 2.49750000000008 | -0.248 | -6.238 | -20.228 |
| 2.50200000000008 | -0.252 | -6.26 | -20.268 |
| 2.50650000000008 | -0.257 | -6.283 | -20.309 |
| 2.51100000000008 | -0.261 | -6.305 | -20.349 |
| 2.515500000000081 | -0.266 | -6.328 | -20.39 |
| 2.520000000000081 | -0.27 | -6.35 | -20.43 |
| 2.524500000000081 | -0.275 | -6.373 | -20.471 |
| 2.529000000000081 | -0.28 | -6.396 | -20.512 |
| 2.533500000000081 | -0.285 | -6.419 | -20.553 |
| 2.538000000000082 | -0.289 | -6.441 | -20.593 |
| 2.542500000000082 | -0.294 | -6.464 | -20.634 |
| 2.547000000000082 | -0.299 | -6.487 | -20.675 |
| 2.551500000000082 | -0.304 | -6.51 | -20.716 |
| 2.556000000000082 | -0.309 | -6.533 | -20.757 |
| 2.560500000000082 | -0.314 | -6.556 | -20.798 |
| 2.565000000000083 | -0.319 | -6.579 | -20.839 |
| 2.569500000000083 | -0.324 | -6.602 | -20.88 |
| 2.574000000000083 | -0.329 | -6.625 | -20.921 |
| 2.578500000000083 | -0.335 | -6.649 | -20.963 |
| 2.583000000000083 | -0.34 | -6.672 | -21.004 |
| 2.587500000000083 | -0.345 | -6.695 | -21.045 |
| 2.592000000000084 | -0.35 | -6.718 | -21.086 |
| 2.596500000000084 | -0.356 | -6.742 | -21.128 |
| 2.601000000000084 | -0.361 | -6.765 | -21.169 |
| 2.605500000000084 | -0.367 | -6.789 | -21.211 |
| 2.610000000000084 | -0.372 | -6.812 | -21.252 |
| 2.614500000000084 | -0.378 | -6.836 | -21.294 |
| 2.619000000000085 | -0.383 | -6.859 | -21.335 |
| 2.623500000000085 | -0.389 | -6.883 | -21.377 |
| 2.628000000000085 | -0.394 | -6.906 | -21.418 |
| 2.632500000000085 | -0.4 | -6.93 | -21.46 |
| 2.637000000000085 | -0.406 | -6.954 | -21.502 |
| 2.641500000000085 | -0.412 | -6.978 | -21.544 |
| 2.646000000000086 | -0.417 | -7.001 | -21.585 |
| 2.650500000000086 | -0.423 | -7.025 | -21.627 |
| 2.655000000000086 | -0.429 | -7.049 | -21.669 |
| 2.659500000000086 | -0.435 | -7.073 | -21.711 |
| 2.664000000000086 | -0.441 | -7.097 | -21.753 |
| 2.668500000000086 | -0.447 | -7.121 | -21.795 |
| 2.673000000000087 | -0.453 | -7.145 | -21.837 |
| 2.677500000000087 | -0.459 | -7.169 | -21.879 |
| 2.682000000000087 | -0.465 | -7.193 | -21.921 |
| 2.686500000000087 | -0.471 | -7.217 | -21.963 |
| 2.691000000000087 | -0.477 | -7.241 | -22.005 |
| 2.695500000000087 | -0.484 | -7.266 | -22.048 |
| 2.700000000000088 | -0.49 | -7.29 | -22.09 |
| 2.704500000000088 | -0.496 | -7.314 | -22.132 |
| 2.709000000000088 | -0.503 | -7.339 | -22.175 |
| 2.713500000000088 | -0.509 | -7.363 | -22.217 |
| 2.718000000000088 | -0.516 | -7.388 | -22.26 |
| 2.722500000000088 | -0.522 | -7.412 | -22.302 |
| 2.727000000000089 | -0.529 | -7.437 | -22.345 |
| 2.731500000000089 | -0.535 | -7.461 | -22.387 |
| 2.736000000000089 | -0.542 | -7.486 | -22.43 |
| 2.74050000000009 | -0.548 | -7.51 | -22.472 |
| 2.745000000000089 | -0.555 | -7.535 | -22.515 |
| 2.749500000000089 | -0.562 | -7.56 | -22.558 |
| 2.75400000000009 | -0.569 | -7.585 | -22.601 |
| 2.75850000000009 | -0.575 | -7.609 | -22.643 |
| 2.76300000000009 | -0.582 | -7.634 | -22.686 |
| 2.76750000000009 | -0.589 | -7.659 | -22.729 |
| 2.77200000000009 | -0.596 | -7.684 | -22.772 |
| 2.77650000000009 | -0.603 | -7.709 | -22.815 |
| 2.781000000000091 | -0.61 | -7.734 | -22.858 |
| 2.785500000000091 | -0.617 | -7.759 | -22.901 |
| 2.790000000000091 | -0.624 | -7.784 | -22.944 |
| 2.794500000000091 | -0.631 | -7.809 | -22.987 |
| 2.799000000000091 | -0.638 | -7.834 | -23.03 |
| 2.803500000000092 | -0.646 | -7.86 | -23.074 |
| 2.808000000000092 | -0.653 | -7.885 | -23.117 |
| 2.812500000000092 | -0.66 | -7.91 | -23.16 |
| 2.817000000000092 | -0.667 | -7.935 | -23.203 |
| 2.821500000000092 | -0.675 | -7.961 | -23.247 |
| 2.826000000000092 | -0.682 | -7.986 | -23.29 |
| 2.830500000000093 | -0.69 | -8.012 | -23.334 |
| 2.835000000000093 | -0.697 | -8.037 | -23.377 |
| 2.839500000000093 | -0.705 | -8.063 | -23.421 |
| 2.844000000000093 | -0.712 | -8.088 | -23.464 |
| 2.848500000000093 | -0.72 | -8.114 | -23.508 |
| 2.853000000000093 | -0.728 | -8.14 | -23.552 |
| 2.857500000000094 | -0.735 | -8.165 | -23.595 |
| 2.862000000000094 | -0.743 | -8.191 | -23.639 |
| 2.866500000000094 | -0.751 | -8.217 | -23.683 |
| 2.871000000000094 | -0.759 | -8.243 | -23.727 |
| 2.875500000000094 | -0.767 | -8.269 | -23.771 |
| 2.880000000000094 | -0.774 | -8.294 | -23.814 |
| 2.884500000000095 | -0.782 | -8.32 | -23.858 |
| 2.889000000000095 | -0.79 | -8.346 | -23.902 |
| 2.893500000000095 | -0.798 | -8.372 | -23.946 |
| 2.898000000000095 | -0.806 | -8.398 | -23.99 |
| 2.902500000000095 | -0.815 | -8.425 | -24.035 |
| 2.907000000000095 | -0.823 | -8.451 | -24.079 |
| 2.911500000000096 | -0.831 | -8.477 | -24.123 |
| 2.916000000000096 | -0.839 | -8.503 | -24.167 |
| 2.920500000000096 | -0.847 | -8.529 | -24.211 |
| 2.925000000000096 | -0.856 | -8.556 | -24.256 |
| 2.929500000000096 | -0.864 | -8.582 | -24.3 |
| 2.934000000000097 | -0.872 | -8.608 | -24.344 |
| 2.938500000000097 | -0.881 | -8.635 | -24.389 |
| 2.943000000000097 | -0.889 | -8.661 | -24.433 |
| 2.947500000000097 | -0.898 | -8.688 | -24.478 |
| 2.952000000000097 | -0.906 | -8.714 | -24.522 |
| 2.956500000000097 | -0.915 | -8.741 | -24.567 |
| 2.961000000000098 | -0.924 | -8.768 | -24.612 |
| 2.965500000000098 | -0.932 | -8.794 | -24.656 |
| 2.970000000000098 | -0.941 | -8.821 | -24.701 |
| 2.974500000000098 | -0.95 | -8.848 | -24.746 |
| 2.979000000000098 | -0.958 | -8.874 | -24.79 |
| 2.983500000000098 | -0.967 | -8.901 | -24.835 |
| 2.988000000000099 | -0.976 | -8.928 | -24.88 |
| 2.992500000000099 | -0.985 | -8.955 | -24.925 |
| 2.997000000000099 | -0.994 | -8.982 | -24.97 |
| 3.0015000000001 | -1.003 | -9.009 | -25.015 |
| 3.006000000000099 | -1.012 | -9.036 | -25.06 |
| 3.010500000000099 | -1.021 | -9.063 | -25.105 |
| 3.0150000000001 | -1.03 | -9.09 | -25.15 |
| 3.0195000000001 | -1.039 | -9.117 | -25.195 |
| 3.0240000000001 | -1.049 | -9.145 | -25.241 |
| 3.0285000000001 | -1.058 | -9.172 | -25.286 |
| 3.0330000000001 | -1.067 | -9.199 | -25.331 |
| 3.0375000000001 | -1.076 | -9.226 | -25.376 |
| 3.042000000000101 | -1.086 | -9.254 | -25.422 |
| 3.046500000000101 | -1.095 | -9.281 | -25.467 |
| 3.051000000000101 | -1.105 | -9.309 | -25.513 |
| 3.055500000000101 | -1.114 | -9.336 | -25.558 |
| 3.060000000000101 | -1.124 | -9.364 | -25.604 |
| 3.064500000000101 | -1.133 | -9.391 | -25.649 |
| 3.069000000000102 | -1.143 | -9.419 | -25.695 |
| 3.073500000000102 | -1.152 | -9.446 | -25.74 |
| 3.078000000000102 | -1.162 | -9.474 | -25.786 |
| 3.082500000000102 | -1.172 | -9.502 | -25.832 |
| 3.087000000000102 | -1.182 | -9.53 | -25.878 |
| 3.091500000000102 | -1.191 | -9.557 | -25.923 |
| 3.096000000000103 | -1.201 | -9.585 | -25.969 |
| 3.100500000000103 | -1.211 | -9.613 | -26.015 |
| 3.105000000000103 | -1.221 | -9.641 | -26.061 |
| 3.109500000000103 | -1.231 | -9.669 | -26.107 |
| 3.114000000000103 | -1.241 | -9.697 | -26.153 |
| 3.118500000000104 | -1.251 | -9.725 | -26.199 |
| 3.123000000000104 | -1.261 | -9.753 | -26.245 |
| 3.127500000000104 | -1.271 | -9.781 | -26.291 |
| 3.132000000000104 | -1.281 | -9.809 | -26.337 |
| 3.136500000000104 | -1.292 | -9.838 | -26.384 |
| 3.141000000000104 | -1.302 | -9.866 | -26.43 |
| 3.145500000000105 | -1.312 | -9.894 | -26.476 |
| 3.150000000000105 | -1.323 | -9.923 | -26.523 |
| 3.154500000000105 | -1.333 | -9.951 | -26.569 |
| 3.159000000000105 | -1.343 | -9.979 | -26.615 |
| 3.163500000000105 | -1.354 | -10.008 | -26.662 |
| 3.168000000000105 | -1.364 | -10.036 | -26.708 |
| 3.172500000000106 | -1.375 | -10.065 | -26.755 |
| 3.177000000000106 | -1.385 | -10.093 | -26.801 |
| 3.181500000000106 | -1.396 | -10.122 | -26.848 |
| 3.186000000000106 | -1.407 | -10.151 | -26.895 |
| 3.190500000000106 | -1.417 | -10.179 | -26.941 |
| 3.195000000000106 | -1.428 | -10.208 | -26.988 |
| 3.199500000000107 | -1.439 | -10.237 | -27.035 |
| 3.204000000000107 | -1.45 | -10.266 | -27.082 |
| 3.208500000000107 | -1.46 | -10.294 | -27.128 |
| 3.213000000000107 | -1.471 | -10.323 | -27.175 |
| 3.217500000000107 | -1.482 | -10.352 | -27.222 |
| 3.222000000000107 | -1.493 | -10.381 | -27.269 |
| 3.226500000000108 | -1.504 | -10.41 | -27.316 |
| 3.231000000000108 | -1.515 | -10.439 | -27.363 |
| 3.235500000000108 | -1.526 | -10.468 | -27.41 |
| 3.240000000000108 | -1.538 | -10.498 | -27.458 |
| 3.244500000000108 | -1.549 | -10.527 | -27.505 |
| 3.249000000000108 | -1.56 | -10.556 | -27.552 |
| 3.253500000000109 | -1.571 | -10.585 | -27.599 |
| 3.258000000000109 | -1.583 | -10.615 | -27.647 |
| 3.262500000000109 | -1.594 | -10.644 | -27.694 |
| 3.26700000000011 | -1.605 | -10.673 | -27.741 |
| 3.271500000000109 | -1.617 | -10.703 | -27.789 |
| 3.276000000000109 | -1.628 | -10.732 | -27.836 |
| 3.28050000000011 | -1.64 | -10.762 | -27.884 |
| 3.28500000000011 | -1.651 | -10.791 | -27.931 |
| 3.28950000000011 | -1.663 | -10.821 | -27.979 |
| 3.29400000000011 | -1.674 | -10.85 | -28.026 |
| 3.29850000000011 | -1.686 | -10.88 | -28.074 |
| 3.30300000000011 | -1.698 | -10.91 | -28.122 |
| 3.307500000000111 | -1.71 | -10.94 | -28.17 |
| 3.312000000000111 | -1.721 | -10.969 | -28.217 |
| 3.316500000000111 | -1.733 | -10.999 | -28.265 |
| 3.321000000000111 | -1.745 | -11.029 | -28.313 |
| 3.325500000000111 | -1.757 | -11.059 | -28.361 |
| 3.330000000000111 | -1.769 | -11.089 | -28.409 |
| 3.334500000000112 | -1.781 | -11.119 | -28.457 |
| 3.339000000000112 | -1.793 | -11.149 | -28.505 |
| 3.343500000000112 | -1.805 | -11.179 | -28.553 |
| 3.348000000000112 | -1.817 | -11.209 | -28.601 |
| 3.352500000000112 | -1.829 | -11.239 | -28.649 |
| 3.357000000000113 | -1.841 | -11.269 | -28.697 |
| 3.361500000000113 | -1.854 | -11.3 | -28.746 |
| 3.366000000000113 | -1.866 | -11.33 | -28.794 |
| 3.370500000000113 | -1.878 | -11.36 | -28.842 |
| 3.375000000000113 | -1.891 | -11.391 | -28.891 |
| 3.379500000000113 | -1.903 | -11.421 | -28.939 |
| 3.384000000000114 | -1.915 | -11.451 | -28.987 |
| 3.388500000000114 | -1.928 | -11.482 | -29.036 |
| 3.393000000000114 | -1.94 | -11.512 | -29.084 |
| 3.397500000000114 | -1.953 | -11.543 | -29.133 |
| 3.402000000000114 | -1.966 | -11.574 | -29.182 |
| 3.406500000000114 | -1.978 | -11.604 | -29.23 |
| 3.411000000000115 | -1.991 | -11.635 | -29.279 |
| 3.415500000000115 | -2.004 | -11.666 | -29.328 |
| 3.420000000000115 | -2.016 | -11.696 | -29.376 |
| 3.424500000000115 | -2.029 | -11.727 | -29.425 |
| 3.429000000000115 | -2.042 | -11.758 | -29.474 |
| 3.433500000000115 | -2.055 | -11.789 | -29.523 |
| 3.438000000000116 | -2.068 | -11.82 | -29.572 |
| 3.442500000000116 | -2.081 | -11.851 | -29.621 |
| 3.447000000000116 | -2.094 | -11.882 | -29.67 |
| 3.451500000000116 | -2.107 | -11.913 | -29.719 |
| 3.456000000000116 | -2.12 | -11.944 | -29.768 |
| 3.460500000000116 | -2.133 | -11.975 | -29.817 |
| 3.465000000000117 | -2.146 | -12.006 | -29.866 |
| 3.469500000000117 | -2.159 | -12.037 | -29.915 |
| 3.474000000000117 | -2.173 | -12.069 | -29.965 |
| 3.478500000000117 | -2.186 | -12.1 | -30.014 |
| 3.483000000000117 | -2.199 | -12.131 | -30.063 |
| 3.487500000000117 | -2.213 | -12.163 | -30.113 |
| 3.492000000000118 | -2.226 | -12.194 | -30.162 |
| 3.496500000000118 | -2.24 | -12.226 | -30.212 |
| 3.501000000000118 | -2.253 | -12.257 | -30.261 |
| 3.505500000000118 | -2.267 | -12.289 | -30.311 |
| 3.510000000000118 | -2.28 | -12.32 | -30.36 |
| 3.514500000000119 | -2.294 | -12.352 | -30.41 |
| 3.519000000000119 | -2.307 | -12.383 | -30.459 |
| 3.523500000000119 | -2.321 | -12.415 | -30.509 |
| 3.52800000000012 | -2.335 | -12.447 | -30.559 |
| 3.532500000000119 | -2.349 | -12.479 | -30.609 |
| 3.537000000000119 | -2.362 | -12.51 | -30.658 |
| 3.54150000000012 | -2.376 | -12.542 | -30.708 |
| 3.54600000000012 | -2.39 | -12.574 | -30.758 |
| 3.55050000000012 | -2.404 | -12.606 | -30.808 |
| 3.55500000000012 | -2.418 | -12.638 | -30.858 |
| 3.55950000000012 | -2.432 | -12.67 | -30.908 |
| 3.56400000000012 | -2.446 | -12.702 | -30.958 |
| 3.568500000000121 | -2.46 | -12.734 | -31.008 |
| 3.573000000000121 | -2.474 | -12.766 | -31.058 |
| 3.577500000000121 | -2.489 | -12.799 | -31.109 |
| 3.582000000000121 | -2.503 | -12.831 | -31.159 |
| 3.586500000000121 | -2.517 | -12.863 | -31.209 |
| 3.591000000000121 | -2.531 | -12.895 | -31.259 |
| 3.595500000000122 | -2.546 | -12.928 | -31.31 |
| 3.600000000000122 | -2.56 | -12.96 | -31.36 |
| 3.604500000000122 | -2.574 | -12.992 | -31.41 |
| 3.609000000000122 | -2.589 | -13.025 | -31.461 |
| 3.613500000000122 | -2.603 | -13.057 | -31.511 |
| 3.618000000000122 | -2.618 | -13.09 | -31.562 |
| 3.622500000000123 | -2.633 | -13.123 | -31.613 |
| 3.627000000000123 | -2.647 | -13.155 | -31.663 |
| 3.631500000000123 | -2.662 | -13.188 | -31.714 |
| 3.636000000000123 | -2.676 | -13.22 | -31.764 |
| 3.640500000000123 | -2.691 | -13.253 | -31.815 |
| 3.645000000000123 | -2.706 | -13.286 | -31.866 |
| 3.649500000000124 | -2.721 | -13.319 | -31.917 |
| 3.654000000000124 | -2.736 | -13.352 | -31.968 |
| 3.658500000000124 | -2.751 | -13.385 | -32.019 |
| 3.663000000000124 | -2.766 | -13.418 | -32.07 |
| 3.667500000000124 | -2.781 | -13.451 | -32.121 |
| 3.672000000000124 | -2.796 | -13.484 | -32.172 |
| 3.676500000000125 | -2.811 | -13.517 | -32.223 |
| 3.681000000000125 | -2.826 | -13.55 | -32.274 |
| 3.685500000000125 | -2.841 | -13.583 | -32.325 |
| 3.690000000000125 | -2.856 | -13.616 | -32.376 |
| 3.694500000000125 | -2.871 | -13.649 | -32.427 |
| 3.699000000000125 | -2.887 | -13.683 | -32.479 |
| 3.703500000000126 | -2.902 | -13.716 | -32.53 |
| 3.708000000000126 | -2.917 | -13.749 | -32.581 |
| 3.712500000000126 | -2.933 | -13.783 | -32.633 |
| 3.717000000000126 | -2.948 | -13.816 | -32.684 |
| 3.721500000000126 | -2.964 | -13.85 | -32.736 |
| 3.726000000000126 | -2.979 | -13.883 | -32.787 |
| 3.730500000000127 | -2.995 | -13.917 | -32.839 |
| 3.735000000000127 | -3.01 | -13.95 | -32.89 |
| 3.739500000000127 | -3.026 | -13.984 | -32.942 |
| 3.744000000000127 | -3.042 | -14.018 | -32.994 |
| 3.748500000000127 | -3.057 | -14.051 | -33.045 |
| 3.753000000000127 | -3.073 | -14.085 | -33.097 |
| 3.757500000000128 | -3.089 | -14.119 | -33.149 |
| 3.762000000000128 | -3.105 | -14.153 | -33.201 |
| 3.766500000000128 | -3.121 | -14.187 | -33.253 |
| 3.771000000000128 | -3.136 | -14.22 | -33.304 |
| 3.775500000000128 | -3.152 | -14.254 | -33.356 |
| 3.780000000000129 | -3.168 | -14.288 | -33.408 |
| 3.784500000000129 | -3.184 | -14.322 | -33.46 |
| 3.789000000000129 | -3.201 | -14.357 | -33.513 |
| 3.79350000000013 | -3.217 | -14.391 | -33.565 |
| 3.798000000000129 | -3.233 | -14.425 | -33.617 |
| 3.802500000000129 | -3.249 | -14.459 | -33.669 |
| 3.80700000000013 | -3.265 | -14.493 | -33.721 |
| 3.81150000000013 | -3.282 | -14.528 | -33.774 |
| 3.81600000000013 | -3.298 | -14.562 | -33.826 |
| 3.82050000000013 | -3.314 | -14.596 | -33.878 |
| 3.82500000000013 | -3.331 | -14.631 | -33.931 |
| 3.82950000000013 | -3.347 | -14.665 | -33.983 |
| 3.834000000000131 | -3.364 | -14.7 | -34.036 |
| 3.838500000000131 | -3.38 | -14.734 | -34.088 |
| 3.843000000000131 | -3.397 | -14.769 | -34.141 |
| 3.847500000000131 | -3.413 | -14.803 | -34.193 |
| 3.852000000000131 | -3.43 | -14.838 | -34.246 |
| 3.856500000000131 | -3.447 | -14.873 | -34.299 |
| 3.861000000000132 | -3.463 | -14.907 | -34.351 |
| 3.865500000000132 | -3.48 | -14.942 | -34.404 |
| 3.870000000000132 | -3.497 | -14.977 | -34.457 |
| 3.874500000000132 | -3.514 | -15.012 | -34.51 |
| 3.879000000000132 | -3.531 | -15.047 | -34.563 |
| 3.883500000000132 | -3.548 | -15.082 | -34.616 |
| 3.888000000000133 | -3.565 | -15.117 | -34.669 |
| 3.892500000000133 | -3.582 | -15.152 | -34.722 |
| 3.897000000000133 | -3.599 | -15.187 | -34.775 |
| 3.901500000000133 | -3.616 | -15.222 | -34.828 |
| 3.906000000000133 | -3.633 | -15.257 | -34.881 |
| 3.910500000000134 | -3.65 | -15.292 | -34.934 |
| 3.915000000000134 | -3.667 | -15.327 | -34.987 |
| 3.919500000000134 | -3.684 | -15.362 | -35.04 |
| 3.924000000000134 | -3.702 | -15.398 | -35.094 |
| 3.928500000000134 | -3.719 | -15.433 | -35.147 |
| 3.933000000000134 | -3.736 | -15.468 | -35.2 |
| 3.937500000000135 | -3.754 | -15.504 | -35.254 |
| 3.942000000000135 | -3.771 | -15.539 | -35.307 |
| 3.946500000000135 | -3.789 | -15.575 | -35.361 |
| 3.951000000000135 | -3.806 | -15.61 | -35.414 |
| 3.955500000000135 | -3.824 | -15.646 | -35.468 |
| 3.960000000000135 | -3.842 | -15.682 | -35.522 |
| 3.964500000000136 | -3.859 | -15.717 | -35.575 |
| 3.969000000000136 | -3.877 | -15.753 | -35.629 |
| 3.973500000000136 | -3.895 | -15.789 | -35.683 |
| 3.978000000000136 | -3.912 | -15.824 | -35.736 |
| 3.982500000000136 | -3.93 | -15.86 | -35.79 |
| 3.987000000000136 | -3.948 | -15.896 | -35.844 |
| 3.991500000000137 | -3.966 | -15.932 | -35.898 |
| 3.996000000000137 | -3.984 | -15.968 | -35.952 |
| 4.000500000000136 | -4.002 | -16.004 | -36.006 |
| 4.005000000000136 | -4.02 | -16.04 | -36.06 |
| 4.009500000000136 | -4.038 | -16.076 | -36.114 |
| 4.014000000000137 | -4.056 | -16.112 | -36.168 |
| 4.018500000000137 | -4.074 | -16.148 | -36.222 |
| 4.023000000000137 | -4.093 | -16.185 | -36.277 |
| 4.027500000000138 | -4.111 | -16.221 | -36.331 |
| 4.032000000000137 | -4.129 | -16.257 | -36.385 |
| 4.036500000000137 | -4.147 | -16.293 | -36.439 |
| 4.041000000000138 | -4.166 | -16.33 | -36.494 |
| 4.045500000000138 | -4.184 | -16.366 | -36.548 |
| 4.050000000000138 | -4.203 | -16.403 | -36.603 |
| 4.054500000000139 | -4.221 | -16.439 | -36.657 |
| 4.059000000000138 | -4.239 | -16.475 | -36.711 |
| 4.063500000000139 | -4.258 | -16.512 | -36.766 |
| 4.06800000000014 | -4.277 | -16.549 | -36.821 |
| 4.07250000000014 | -4.295 | -16.585 | -36.875 |
| 4.07700000000014 | -4.314 | -16.622 | -36.93 |
| 4.08150000000014 | -4.333 | -16.659 | -36.985 |
| 4.08600000000014 | -4.351 | -16.695 | -37.039 |
| 4.09050000000014 | -4.37 | -16.732 | -37.094 |
| 4.09500000000014 | -4.389 | -16.769 | -37.149 |
| 4.09950000000014 | -4.408 | -16.806 | -37.204 |
| 4.10400000000014 | -4.427 | -16.843 | -37.259 |
| 4.108500000000141 | -4.446 | -16.88 | -37.314 |
| 4.113000000000141 | -4.465 | -16.917 | -37.369 |
| 4.117500000000141 | -4.484 | -16.954 | -37.424 |
| 4.122000000000141 | -4.503 | -16.991 | -37.479 |
| 4.126500000000141 | -4.522 | -17.028 | -37.534 |
| 4.131000000000141 | -4.541 | -17.065 | -37.589 |
| 4.135500000000142 | -4.56 | -17.102 | -37.644 |
| 4.140000000000142 | -4.58 | -17.14 | -37.7 |
| 4.144500000000142 | -4.599 | -17.177 | -37.755 |
| 4.149000000000142 | -4.618 | -17.214 | -37.81 |
| 4.153500000000142 | -4.638 | -17.252 | -37.866 |
| 4.158000000000142 | -4.657 | -17.289 | -37.921 |
| 4.162500000000143 | -4.676 | -17.326 | -37.976 |
| 4.167000000000143 | -4.696 | -17.364 | -38.032 |
| 4.171500000000143 | -4.715 | -17.401 | -38.087 |
| 4.176000000000143 | -4.735 | -17.439 | -38.143 |
| 4.180500000000143 | -4.755 | -17.477 | -38.199 |
| 4.185000000000143 | -4.774 | -17.514 | -38.254 |
| 4.189500000000144 | -4.794 | -17.552 | -38.31 |
| 4.194000000000144 | -4.814 | -17.59 | -38.366 |
| 4.198500000000144 | -4.833 | -17.627 | -38.421 |
| 4.203000000000144 | -4.853 | -17.665 | -38.477 |
| 4.207500000000144 | -4.873 | -17.703 | -38.533 |
| 4.212000000000144 | -4.893 | -17.741 | -38.589 |
| 4.216500000000144 | -4.913 | -17.779 | -38.645 |
| 4.221000000000144 | -4.933 | -17.817 | -38.701 |
| 4.225500000000145 | -4.953 | -17.855 | -38.757 |
| 4.230000000000145 | -4.973 | -17.893 | -38.813 |
| 4.234500000000145 | -4.993 | -17.931 | -38.869 |
| 4.239000000000145 | -5.013 | -17.969 | -38.925 |
| 4.243500000000145 | -5.033 | -18.007 | -38.981 |
| 4.248000000000145 | -5.054 | -18.046 | -39.038 |
| 4.252500000000146 | -5.074 | -18.084 | -39.094 |
| 4.257000000000146 | -5.094 | -18.122 | -39.15 |
| 4.261500000000146 | -5.114 | -18.16 | -39.206 |
| 4.266000000000146 | -5.135 | -18.199 | -39.263 |
| 4.270500000000146 | -5.155 | -18.237 | -39.319 |
| 4.275000000000146 | -5.176 | -18.276 | -39.376 |
| 4.279500000000147 | -5.196 | -18.314 | -39.432 |
| 4.284000000000147 | -5.217 | -18.353 | -39.489 |
| 4.288500000000147 | -5.237 | -18.391 | -39.545 |
| 4.293000000000147 | -5.258 | -18.43 | -39.602 |
| 4.297500000000148 | -5.279 | -18.469 | -39.659 |
| 4.302000000000148 | -5.299 | -18.507 | -39.715 |
| 4.306500000000148 | -5.32 | -18.546 | -39.772 |
| 4.311000000000148 | -5.341 | -18.585 | -39.829 |
| 4.315500000000148 | -5.362 | -18.624 | -39.886 |
| 4.320000000000149 | -5.382 | -18.662 | -39.942 |
| 4.324500000000149 | -5.403 | -18.701 | -39.999 |
| 4.329000000000149 | -5.424 | -18.74 | -40.056 |
| 4.33350000000015 | -5.445 | -18.779 | -40.113 |
| 4.33800000000015 | -5.466 | -18.818 | -40.17 |
| 4.342500000000149 | -5.487 | -18.857 | -40.227 |
| 4.34700000000015 | -5.508 | -18.896 | -40.284 |
| 4.35150000000015 | -5.53 | -18.936 | -40.342 |
| 4.35600000000015 | -5.551 | -18.975 | -40.399 |
| 4.36050000000015 | -5.572 | -19.014 | -40.456 |
| 4.36500000000015 | -5.593 | -19.053 | -40.513 |
| 4.36950000000015 | -5.615 | -19.093 | -40.571 |
| 4.374000000000151 | -5.636 | -19.132 | -40.628 |
| 4.378500000000151 | -5.657 | -19.171 | -40.685 |
| 4.383000000000151 | -5.679 | -19.211 | -40.743 |
| 4.387500000000151 | -5.7 | -19.25 | -40.8 |
| 4.392000000000151 | -5.722 | -19.29 | -40.858 |
| 4.396500000000151 | -5.743 | -19.329 | -40.915 |
| 4.401000000000151 | -5.765 | -19.369 | -40.973 |
| 4.405500000000152 | -5.786 | -19.408 | -41.03 |
| 4.410000000000152 | -5.808 | -19.448 | -41.088 |
| 4.414500000000152 | -5.83 | -19.488 | -41.146 |
| 4.419000000000152 | -5.852 | -19.528 | -41.204 |
| 4.423500000000153 | -5.873 | -19.567 | -41.261 |
| 4.428000000000153 | -5.895 | -19.607 | -41.319 |
| 4.432500000000153 | -5.917 | -19.647 | -41.377 |
| 4.437000000000153 | -5.939 | -19.687 | -41.435 |
| 4.441500000000153 | -5.961 | -19.727 | -41.493 |
| 4.446000000000153 | -5.983 | -19.767 | -41.551 |
| 4.450500000000154 | -6.005 | -19.807 | -41.609 |
| 4.455000000000154 | -6.027 | -19.847 | -41.667 |
| 4.459500000000154 | -6.049 | -19.887 | -41.725 |
| 4.464000000000154 | -6.071 | -19.927 | -41.783 |
| 4.468500000000154 | -6.093 | -19.967 | -41.841 |
| 4.473000000000154 | -6.116 | -20.008 | -41.9 |
| 4.477500000000154 | -6.138 | -20.048 | -41.958 |
| 4.482000000000154 | -6.16 | -20.088 | -42.016 |
| 4.486500000000154 | -6.183 | -20.129 | -42.075 |
| 4.491000000000155 | -6.205 | -20.169 | -42.133 |
| 4.495500000000155 | -6.228 | -20.21 | -42.192 |
| 4.500000000000155 | -6.25 | -20.25 | -42.25 |